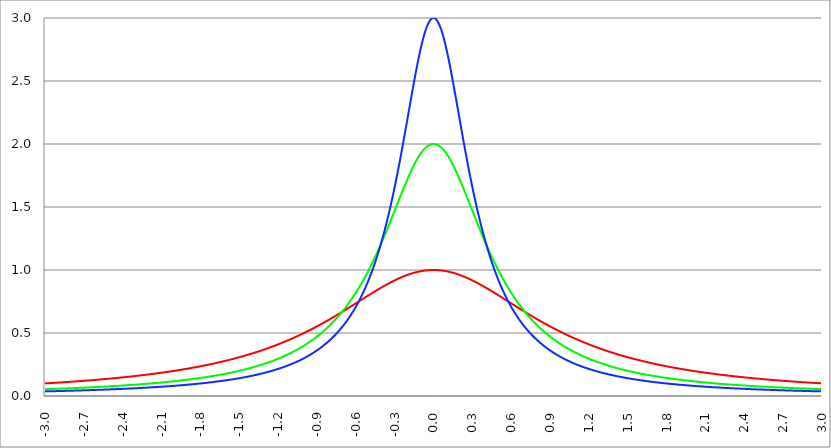
| Category | Series 1 | Series 0 | Series 2 |
|---|---|---|---|
| -3.0 | 0.1 | 0.054 | 0.037 |
| -2.997 | 0.1 | 0.054 | 0.037 |
| -2.994 | 0.1 | 0.054 | 0.037 |
| -2.991 | 0.101 | 0.054 | 0.037 |
| -2.988 | 0.101 | 0.054 | 0.037 |
| -2.984999999999999 | 0.101 | 0.055 | 0.037 |
| -2.981999999999999 | 0.101 | 0.055 | 0.037 |
| -2.978999999999999 | 0.101 | 0.055 | 0.037 |
| -2.975999999999999 | 0.101 | 0.055 | 0.037 |
| -2.972999999999999 | 0.102 | 0.055 | 0.037 |
| -2.969999999999999 | 0.102 | 0.055 | 0.037 |
| -2.966999999999999 | 0.102 | 0.055 | 0.037 |
| -2.963999999999999 | 0.102 | 0.055 | 0.037 |
| -2.960999999999998 | 0.102 | 0.055 | 0.038 |
| -2.957999999999998 | 0.103 | 0.056 | 0.038 |
| -2.954999999999998 | 0.103 | 0.056 | 0.038 |
| -2.951999999999998 | 0.103 | 0.056 | 0.038 |
| -2.948999999999998 | 0.103 | 0.056 | 0.038 |
| -2.945999999999998 | 0.103 | 0.056 | 0.038 |
| -2.942999999999998 | 0.104 | 0.056 | 0.038 |
| -2.939999999999998 | 0.104 | 0.056 | 0.038 |
| -2.936999999999998 | 0.104 | 0.056 | 0.038 |
| -2.933999999999997 | 0.104 | 0.056 | 0.038 |
| -2.930999999999997 | 0.104 | 0.057 | 0.038 |
| -2.927999999999997 | 0.104 | 0.057 | 0.038 |
| -2.924999999999997 | 0.105 | 0.057 | 0.038 |
| -2.921999999999997 | 0.105 | 0.057 | 0.039 |
| -2.918999999999997 | 0.105 | 0.057 | 0.039 |
| -2.915999999999997 | 0.105 | 0.057 | 0.039 |
| -2.912999999999997 | 0.105 | 0.057 | 0.039 |
| -2.909999999999997 | 0.106 | 0.057 | 0.039 |
| -2.906999999999996 | 0.106 | 0.057 | 0.039 |
| -2.903999999999996 | 0.106 | 0.058 | 0.039 |
| -2.900999999999996 | 0.106 | 0.058 | 0.039 |
| -2.897999999999996 | 0.106 | 0.058 | 0.039 |
| -2.894999999999996 | 0.107 | 0.058 | 0.039 |
| -2.891999999999996 | 0.107 | 0.058 | 0.039 |
| -2.888999999999996 | 0.107 | 0.058 | 0.039 |
| -2.885999999999996 | 0.107 | 0.058 | 0.039 |
| -2.882999999999996 | 0.107 | 0.058 | 0.04 |
| -2.879999999999995 | 0.108 | 0.059 | 0.04 |
| -2.876999999999995 | 0.108 | 0.059 | 0.04 |
| -2.873999999999995 | 0.108 | 0.059 | 0.04 |
| -2.870999999999995 | 0.108 | 0.059 | 0.04 |
| -2.867999999999995 | 0.108 | 0.059 | 0.04 |
| -2.864999999999995 | 0.109 | 0.059 | 0.04 |
| -2.861999999999995 | 0.109 | 0.059 | 0.04 |
| -2.858999999999995 | 0.109 | 0.059 | 0.04 |
| -2.855999999999994 | 0.109 | 0.059 | 0.04 |
| -2.852999999999994 | 0.109 | 0.06 | 0.04 |
| -2.849999999999994 | 0.11 | 0.06 | 0.04 |
| -2.846999999999994 | 0.11 | 0.06 | 0.041 |
| -2.843999999999994 | 0.11 | 0.06 | 0.041 |
| -2.840999999999994 | 0.11 | 0.06 | 0.041 |
| -2.837999999999994 | 0.11 | 0.06 | 0.041 |
| -2.834999999999994 | 0.111 | 0.06 | 0.041 |
| -2.831999999999994 | 0.111 | 0.06 | 0.041 |
| -2.828999999999993 | 0.111 | 0.061 | 0.041 |
| -2.825999999999993 | 0.111 | 0.061 | 0.041 |
| -2.822999999999993 | 0.111 | 0.061 | 0.041 |
| -2.819999999999993 | 0.112 | 0.061 | 0.041 |
| -2.816999999999993 | 0.112 | 0.061 | 0.041 |
| -2.813999999999993 | 0.112 | 0.061 | 0.042 |
| -2.810999999999993 | 0.112 | 0.061 | 0.042 |
| -2.807999999999993 | 0.113 | 0.061 | 0.042 |
| -2.804999999999993 | 0.113 | 0.062 | 0.042 |
| -2.801999999999992 | 0.113 | 0.062 | 0.042 |
| -2.798999999999992 | 0.113 | 0.062 | 0.042 |
| -2.795999999999992 | 0.113 | 0.062 | 0.042 |
| -2.792999999999992 | 0.114 | 0.062 | 0.042 |
| -2.789999999999992 | 0.114 | 0.062 | 0.042 |
| -2.786999999999992 | 0.114 | 0.062 | 0.042 |
| -2.783999999999992 | 0.114 | 0.062 | 0.042 |
| -2.780999999999992 | 0.114 | 0.063 | 0.042 |
| -2.777999999999992 | 0.115 | 0.063 | 0.043 |
| -2.774999999999991 | 0.115 | 0.063 | 0.043 |
| -2.771999999999991 | 0.115 | 0.063 | 0.043 |
| -2.768999999999991 | 0.115 | 0.063 | 0.043 |
| -2.765999999999991 | 0.116 | 0.063 | 0.043 |
| -2.762999999999991 | 0.116 | 0.063 | 0.043 |
| -2.759999999999991 | 0.116 | 0.064 | 0.043 |
| -2.756999999999991 | 0.116 | 0.064 | 0.043 |
| -2.753999999999991 | 0.116 | 0.064 | 0.043 |
| -2.75099999999999 | 0.117 | 0.064 | 0.043 |
| -2.74799999999999 | 0.117 | 0.064 | 0.044 |
| -2.74499999999999 | 0.117 | 0.064 | 0.044 |
| -2.74199999999999 | 0.117 | 0.064 | 0.044 |
| -2.73899999999999 | 0.118 | 0.064 | 0.044 |
| -2.73599999999999 | 0.118 | 0.065 | 0.044 |
| -2.73299999999999 | 0.118 | 0.065 | 0.044 |
| -2.72999999999999 | 0.118 | 0.065 | 0.044 |
| -2.72699999999999 | 0.119 | 0.065 | 0.044 |
| -2.723999999999989 | 0.119 | 0.065 | 0.044 |
| -2.720999999999989 | 0.119 | 0.065 | 0.044 |
| -2.717999999999989 | 0.119 | 0.065 | 0.044 |
| -2.714999999999989 | 0.119 | 0.066 | 0.045 |
| -2.711999999999989 | 0.12 | 0.066 | 0.045 |
| -2.708999999999989 | 0.12 | 0.066 | 0.045 |
| -2.705999999999989 | 0.12 | 0.066 | 0.045 |
| -2.702999999999989 | 0.12 | 0.066 | 0.045 |
| -2.699999999999989 | 0.121 | 0.066 | 0.045 |
| -2.696999999999988 | 0.121 | 0.066 | 0.045 |
| -2.693999999999988 | 0.121 | 0.067 | 0.045 |
| -2.690999999999988 | 0.121 | 0.067 | 0.045 |
| -2.687999999999988 | 0.122 | 0.067 | 0.045 |
| -2.684999999999988 | 0.122 | 0.067 | 0.046 |
| -2.681999999999988 | 0.122 | 0.067 | 0.046 |
| -2.678999999999988 | 0.122 | 0.067 | 0.046 |
| -2.675999999999988 | 0.123 | 0.067 | 0.046 |
| -2.672999999999988 | 0.123 | 0.068 | 0.046 |
| -2.669999999999987 | 0.123 | 0.068 | 0.046 |
| -2.666999999999987 | 0.123 | 0.068 | 0.046 |
| -2.663999999999987 | 0.124 | 0.068 | 0.046 |
| -2.660999999999987 | 0.124 | 0.068 | 0.046 |
| -2.657999999999987 | 0.124 | 0.068 | 0.046 |
| -2.654999999999987 | 0.124 | 0.069 | 0.047 |
| -2.651999999999987 | 0.124 | 0.069 | 0.047 |
| -2.648999999999987 | 0.125 | 0.069 | 0.047 |
| -2.645999999999986 | 0.125 | 0.069 | 0.047 |
| -2.642999999999986 | 0.125 | 0.069 | 0.047 |
| -2.639999999999986 | 0.125 | 0.069 | 0.047 |
| -2.636999999999986 | 0.126 | 0.069 | 0.047 |
| -2.633999999999986 | 0.126 | 0.07 | 0.047 |
| -2.630999999999986 | 0.126 | 0.07 | 0.047 |
| -2.627999999999986 | 0.126 | 0.07 | 0.048 |
| -2.624999999999986 | 0.127 | 0.07 | 0.048 |
| -2.621999999999986 | 0.127 | 0.07 | 0.048 |
| -2.618999999999985 | 0.127 | 0.07 | 0.048 |
| -2.615999999999985 | 0.127 | 0.07 | 0.048 |
| -2.612999999999985 | 0.128 | 0.071 | 0.048 |
| -2.609999999999985 | 0.128 | 0.071 | 0.048 |
| -2.606999999999985 | 0.128 | 0.071 | 0.048 |
| -2.603999999999985 | 0.129 | 0.071 | 0.048 |
| -2.600999999999985 | 0.129 | 0.071 | 0.048 |
| -2.597999999999985 | 0.129 | 0.071 | 0.049 |
| -2.594999999999985 | 0.129 | 0.072 | 0.049 |
| -2.591999999999985 | 0.13 | 0.072 | 0.049 |
| -2.588999999999984 | 0.13 | 0.072 | 0.049 |
| -2.585999999999984 | 0.13 | 0.072 | 0.049 |
| -2.582999999999984 | 0.13 | 0.072 | 0.049 |
| -2.579999999999984 | 0.131 | 0.072 | 0.049 |
| -2.576999999999984 | 0.131 | 0.073 | 0.049 |
| -2.573999999999984 | 0.131 | 0.073 | 0.049 |
| -2.570999999999984 | 0.131 | 0.073 | 0.05 |
| -2.567999999999984 | 0.132 | 0.073 | 0.05 |
| -2.564999999999984 | 0.132 | 0.073 | 0.05 |
| -2.561999999999983 | 0.132 | 0.073 | 0.05 |
| -2.558999999999983 | 0.132 | 0.074 | 0.05 |
| -2.555999999999983 | 0.133 | 0.074 | 0.05 |
| -2.552999999999983 | 0.133 | 0.074 | 0.05 |
| -2.549999999999983 | 0.133 | 0.074 | 0.05 |
| -2.546999999999983 | 0.134 | 0.074 | 0.051 |
| -2.543999999999983 | 0.134 | 0.074 | 0.051 |
| -2.540999999999983 | 0.134 | 0.075 | 0.051 |
| -2.537999999999982 | 0.134 | 0.075 | 0.051 |
| -2.534999999999982 | 0.135 | 0.075 | 0.051 |
| -2.531999999999982 | 0.135 | 0.075 | 0.051 |
| -2.528999999999982 | 0.135 | 0.075 | 0.051 |
| -2.525999999999982 | 0.135 | 0.075 | 0.051 |
| -2.522999999999982 | 0.136 | 0.076 | 0.051 |
| -2.519999999999982 | 0.136 | 0.076 | 0.052 |
| -2.516999999999982 | 0.136 | 0.076 | 0.052 |
| -2.513999999999982 | 0.137 | 0.076 | 0.052 |
| -2.510999999999981 | 0.137 | 0.076 | 0.052 |
| -2.507999999999981 | 0.137 | 0.076 | 0.052 |
| -2.504999999999981 | 0.137 | 0.077 | 0.052 |
| -2.501999999999981 | 0.138 | 0.077 | 0.052 |
| -2.498999999999981 | 0.138 | 0.077 | 0.052 |
| -2.495999999999981 | 0.138 | 0.077 | 0.053 |
| -2.492999999999981 | 0.139 | 0.077 | 0.053 |
| -2.489999999999981 | 0.139 | 0.078 | 0.053 |
| -2.486999999999981 | 0.139 | 0.078 | 0.053 |
| -2.48399999999998 | 0.139 | 0.078 | 0.053 |
| -2.48099999999998 | 0.14 | 0.078 | 0.053 |
| -2.47799999999998 | 0.14 | 0.078 | 0.053 |
| -2.47499999999998 | 0.14 | 0.078 | 0.053 |
| -2.47199999999998 | 0.141 | 0.079 | 0.054 |
| -2.46899999999998 | 0.141 | 0.079 | 0.054 |
| -2.46599999999998 | 0.141 | 0.079 | 0.054 |
| -2.46299999999998 | 0.142 | 0.079 | 0.054 |
| -2.45999999999998 | 0.142 | 0.079 | 0.054 |
| -2.456999999999979 | 0.142 | 0.08 | 0.054 |
| -2.453999999999979 | 0.142 | 0.08 | 0.054 |
| -2.450999999999979 | 0.143 | 0.08 | 0.054 |
| -2.44799999999998 | 0.143 | 0.08 | 0.055 |
| -2.444999999999979 | 0.143 | 0.08 | 0.055 |
| -2.441999999999979 | 0.144 | 0.08 | 0.055 |
| -2.438999999999979 | 0.144 | 0.081 | 0.055 |
| -2.435999999999979 | 0.144 | 0.081 | 0.055 |
| -2.432999999999978 | 0.145 | 0.081 | 0.055 |
| -2.429999999999978 | 0.145 | 0.081 | 0.055 |
| -2.426999999999978 | 0.145 | 0.081 | 0.056 |
| -2.423999999999978 | 0.145 | 0.082 | 0.056 |
| -2.420999999999978 | 0.146 | 0.082 | 0.056 |
| -2.417999999999978 | 0.146 | 0.082 | 0.056 |
| -2.414999999999978 | 0.146 | 0.082 | 0.056 |
| -2.411999999999978 | 0.147 | 0.082 | 0.056 |
| -2.408999999999978 | 0.147 | 0.083 | 0.056 |
| -2.405999999999977 | 0.147 | 0.083 | 0.056 |
| -2.402999999999977 | 0.148 | 0.083 | 0.057 |
| -2.399999999999977 | 0.148 | 0.083 | 0.057 |
| -2.396999999999977 | 0.148 | 0.083 | 0.057 |
| -2.393999999999977 | 0.149 | 0.084 | 0.057 |
| -2.390999999999977 | 0.149 | 0.084 | 0.057 |
| -2.387999999999977 | 0.149 | 0.084 | 0.057 |
| -2.384999999999977 | 0.15 | 0.084 | 0.057 |
| -2.381999999999977 | 0.15 | 0.084 | 0.058 |
| -2.378999999999976 | 0.15 | 0.085 | 0.058 |
| -2.375999999999976 | 0.15 | 0.085 | 0.058 |
| -2.372999999999976 | 0.151 | 0.085 | 0.058 |
| -2.369999999999976 | 0.151 | 0.085 | 0.058 |
| -2.366999999999976 | 0.151 | 0.085 | 0.058 |
| -2.363999999999976 | 0.152 | 0.086 | 0.058 |
| -2.360999999999976 | 0.152 | 0.086 | 0.059 |
| -2.357999999999976 | 0.152 | 0.086 | 0.059 |
| -2.354999999999976 | 0.153 | 0.086 | 0.059 |
| -2.351999999999975 | 0.153 | 0.086 | 0.059 |
| -2.348999999999975 | 0.153 | 0.087 | 0.059 |
| -2.345999999999975 | 0.154 | 0.087 | 0.059 |
| -2.342999999999975 | 0.154 | 0.087 | 0.06 |
| -2.339999999999975 | 0.154 | 0.087 | 0.06 |
| -2.336999999999975 | 0.155 | 0.088 | 0.06 |
| -2.333999999999975 | 0.155 | 0.088 | 0.06 |
| -2.330999999999975 | 0.155 | 0.088 | 0.06 |
| -2.327999999999974 | 0.156 | 0.088 | 0.06 |
| -2.324999999999974 | 0.156 | 0.088 | 0.06 |
| -2.321999999999974 | 0.156 | 0.089 | 0.061 |
| -2.318999999999974 | 0.157 | 0.089 | 0.061 |
| -2.315999999999974 | 0.157 | 0.089 | 0.061 |
| -2.312999999999974 | 0.157 | 0.089 | 0.061 |
| -2.309999999999974 | 0.158 | 0.09 | 0.061 |
| -2.306999999999974 | 0.158 | 0.09 | 0.061 |
| -2.303999999999974 | 0.159 | 0.09 | 0.062 |
| -2.300999999999973 | 0.159 | 0.09 | 0.062 |
| -2.297999999999973 | 0.159 | 0.09 | 0.062 |
| -2.294999999999973 | 0.16 | 0.091 | 0.062 |
| -2.291999999999973 | 0.16 | 0.091 | 0.062 |
| -2.288999999999973 | 0.16 | 0.091 | 0.062 |
| -2.285999999999973 | 0.161 | 0.091 | 0.062 |
| -2.282999999999973 | 0.161 | 0.092 | 0.063 |
| -2.279999999999973 | 0.161 | 0.092 | 0.063 |
| -2.276999999999973 | 0.162 | 0.092 | 0.063 |
| -2.273999999999972 | 0.162 | 0.092 | 0.063 |
| -2.270999999999972 | 0.162 | 0.092 | 0.063 |
| -2.267999999999972 | 0.163 | 0.093 | 0.063 |
| -2.264999999999972 | 0.163 | 0.093 | 0.064 |
| -2.261999999999972 | 0.163 | 0.093 | 0.064 |
| -2.258999999999972 | 0.164 | 0.093 | 0.064 |
| -2.255999999999972 | 0.164 | 0.094 | 0.064 |
| -2.252999999999972 | 0.165 | 0.094 | 0.064 |
| -2.249999999999972 | 0.165 | 0.094 | 0.064 |
| -2.246999999999971 | 0.165 | 0.094 | 0.065 |
| -2.243999999999971 | 0.166 | 0.095 | 0.065 |
| -2.240999999999971 | 0.166 | 0.095 | 0.065 |
| -2.237999999999971 | 0.166 | 0.095 | 0.065 |
| -2.234999999999971 | 0.167 | 0.095 | 0.065 |
| -2.231999999999971 | 0.167 | 0.096 | 0.065 |
| -2.228999999999971 | 0.168 | 0.096 | 0.066 |
| -2.225999999999971 | 0.168 | 0.096 | 0.066 |
| -2.222999999999971 | 0.168 | 0.096 | 0.066 |
| -2.21999999999997 | 0.169 | 0.097 | 0.066 |
| -2.21699999999997 | 0.169 | 0.097 | 0.066 |
| -2.21399999999997 | 0.169 | 0.097 | 0.066 |
| -2.21099999999997 | 0.17 | 0.097 | 0.067 |
| -2.20799999999997 | 0.17 | 0.098 | 0.067 |
| -2.20499999999997 | 0.171 | 0.098 | 0.067 |
| -2.20199999999997 | 0.171 | 0.098 | 0.067 |
| -2.19899999999997 | 0.171 | 0.098 | 0.067 |
| -2.19599999999997 | 0.172 | 0.099 | 0.068 |
| -2.192999999999969 | 0.172 | 0.099 | 0.068 |
| -2.189999999999969 | 0.173 | 0.099 | 0.068 |
| -2.186999999999969 | 0.173 | 0.099 | 0.068 |
| -2.18399999999997 | 0.173 | 0.1 | 0.068 |
| -2.180999999999969 | 0.174 | 0.1 | 0.068 |
| -2.177999999999969 | 0.174 | 0.1 | 0.069 |
| -2.174999999999969 | 0.175 | 0.1 | 0.069 |
| -2.171999999999969 | 0.175 | 0.101 | 0.069 |
| -2.168999999999968 | 0.175 | 0.101 | 0.069 |
| -2.165999999999968 | 0.176 | 0.101 | 0.069 |
| -2.162999999999968 | 0.176 | 0.101 | 0.07 |
| -2.159999999999968 | 0.177 | 0.102 | 0.07 |
| -2.156999999999968 | 0.177 | 0.102 | 0.07 |
| -2.153999999999968 | 0.177 | 0.102 | 0.07 |
| -2.150999999999968 | 0.178 | 0.103 | 0.07 |
| -2.147999999999968 | 0.178 | 0.103 | 0.071 |
| -2.144999999999968 | 0.179 | 0.103 | 0.071 |
| -2.141999999999967 | 0.179 | 0.103 | 0.071 |
| -2.138999999999967 | 0.179 | 0.104 | 0.071 |
| -2.135999999999967 | 0.18 | 0.104 | 0.071 |
| -2.132999999999967 | 0.18 | 0.104 | 0.072 |
| -2.129999999999967 | 0.181 | 0.104 | 0.072 |
| -2.126999999999967 | 0.181 | 0.105 | 0.072 |
| -2.123999999999967 | 0.181 | 0.105 | 0.072 |
| -2.120999999999967 | 0.182 | 0.105 | 0.072 |
| -2.117999999999967 | 0.182 | 0.106 | 0.073 |
| -2.114999999999966 | 0.183 | 0.106 | 0.073 |
| -2.111999999999966 | 0.183 | 0.106 | 0.073 |
| -2.108999999999966 | 0.184 | 0.106 | 0.073 |
| -2.105999999999966 | 0.184 | 0.107 | 0.073 |
| -2.102999999999966 | 0.184 | 0.107 | 0.074 |
| -2.099999999999966 | 0.185 | 0.107 | 0.074 |
| -2.096999999999966 | 0.185 | 0.108 | 0.074 |
| -2.093999999999966 | 0.186 | 0.108 | 0.074 |
| -2.090999999999966 | 0.186 | 0.108 | 0.074 |
| -2.087999999999965 | 0.187 | 0.108 | 0.075 |
| -2.084999999999965 | 0.187 | 0.109 | 0.075 |
| -2.081999999999965 | 0.187 | 0.109 | 0.075 |
| -2.078999999999965 | 0.188 | 0.109 | 0.075 |
| -2.075999999999965 | 0.188 | 0.11 | 0.075 |
| -2.072999999999965 | 0.189 | 0.11 | 0.076 |
| -2.069999999999965 | 0.189 | 0.11 | 0.076 |
| -2.066999999999965 | 0.19 | 0.111 | 0.076 |
| -2.063999999999965 | 0.19 | 0.111 | 0.076 |
| -2.060999999999964 | 0.191 | 0.111 | 0.076 |
| -2.057999999999964 | 0.191 | 0.111 | 0.077 |
| -2.054999999999964 | 0.191 | 0.112 | 0.077 |
| -2.051999999999964 | 0.192 | 0.112 | 0.077 |
| -2.048999999999964 | 0.192 | 0.112 | 0.077 |
| -2.045999999999964 | 0.193 | 0.113 | 0.078 |
| -2.042999999999964 | 0.193 | 0.113 | 0.078 |
| -2.039999999999964 | 0.194 | 0.113 | 0.078 |
| -2.036999999999963 | 0.194 | 0.114 | 0.078 |
| -2.033999999999963 | 0.195 | 0.114 | 0.078 |
| -2.030999999999963 | 0.195 | 0.114 | 0.079 |
| -2.027999999999963 | 0.196 | 0.115 | 0.079 |
| -2.024999999999963 | 0.196 | 0.115 | 0.079 |
| -2.021999999999963 | 0.197 | 0.115 | 0.079 |
| -2.018999999999963 | 0.197 | 0.116 | 0.08 |
| -2.015999999999963 | 0.197 | 0.116 | 0.08 |
| -2.012999999999963 | 0.198 | 0.116 | 0.08 |
| -2.009999999999962 | 0.198 | 0.117 | 0.08 |
| -2.006999999999962 | 0.199 | 0.117 | 0.081 |
| -2.003999999999962 | 0.199 | 0.117 | 0.081 |
| -2.000999999999962 | 0.2 | 0.118 | 0.081 |
| -1.997999999999962 | 0.2 | 0.118 | 0.081 |
| -1.994999999999962 | 0.201 | 0.118 | 0.081 |
| -1.991999999999962 | 0.201 | 0.119 | 0.082 |
| -1.988999999999963 | 0.202 | 0.119 | 0.082 |
| -1.985999999999963 | 0.202 | 0.119 | 0.082 |
| -1.982999999999963 | 0.203 | 0.12 | 0.082 |
| -1.979999999999963 | 0.203 | 0.12 | 0.083 |
| -1.976999999999963 | 0.204 | 0.12 | 0.083 |
| -1.973999999999963 | 0.204 | 0.121 | 0.083 |
| -1.970999999999963 | 0.205 | 0.121 | 0.083 |
| -1.967999999999963 | 0.205 | 0.121 | 0.084 |
| -1.964999999999963 | 0.206 | 0.122 | 0.084 |
| -1.961999999999964 | 0.206 | 0.122 | 0.084 |
| -1.958999999999964 | 0.207 | 0.122 | 0.084 |
| -1.955999999999964 | 0.207 | 0.123 | 0.085 |
| -1.952999999999964 | 0.208 | 0.123 | 0.085 |
| -1.949999999999964 | 0.208 | 0.123 | 0.085 |
| -1.946999999999964 | 0.209 | 0.124 | 0.085 |
| -1.943999999999964 | 0.209 | 0.124 | 0.086 |
| -1.940999999999964 | 0.21 | 0.124 | 0.086 |
| -1.937999999999964 | 0.21 | 0.125 | 0.086 |
| -1.934999999999964 | 0.211 | 0.125 | 0.086 |
| -1.931999999999965 | 0.211 | 0.126 | 0.087 |
| -1.928999999999965 | 0.212 | 0.126 | 0.087 |
| -1.925999999999965 | 0.212 | 0.126 | 0.087 |
| -1.922999999999965 | 0.213 | 0.127 | 0.088 |
| -1.919999999999965 | 0.213 | 0.127 | 0.088 |
| -1.916999999999965 | 0.214 | 0.127 | 0.088 |
| -1.913999999999965 | 0.214 | 0.128 | 0.088 |
| -1.910999999999965 | 0.215 | 0.128 | 0.089 |
| -1.907999999999965 | 0.215 | 0.129 | 0.089 |
| -1.904999999999966 | 0.216 | 0.129 | 0.089 |
| -1.901999999999966 | 0.217 | 0.129 | 0.089 |
| -1.898999999999966 | 0.217 | 0.13 | 0.09 |
| -1.895999999999966 | 0.218 | 0.13 | 0.09 |
| -1.892999999999966 | 0.218 | 0.13 | 0.09 |
| -1.889999999999966 | 0.219 | 0.131 | 0.091 |
| -1.886999999999966 | 0.219 | 0.131 | 0.091 |
| -1.883999999999966 | 0.22 | 0.132 | 0.091 |
| -1.880999999999966 | 0.22 | 0.132 | 0.091 |
| -1.877999999999967 | 0.221 | 0.132 | 0.092 |
| -1.874999999999967 | 0.221 | 0.133 | 0.092 |
| -1.871999999999967 | 0.222 | 0.133 | 0.092 |
| -1.868999999999967 | 0.223 | 0.134 | 0.092 |
| -1.865999999999967 | 0.223 | 0.134 | 0.093 |
| -1.862999999999967 | 0.224 | 0.134 | 0.093 |
| -1.859999999999967 | 0.224 | 0.135 | 0.093 |
| -1.856999999999967 | 0.225 | 0.135 | 0.094 |
| -1.853999999999967 | 0.225 | 0.136 | 0.094 |
| -1.850999999999968 | 0.226 | 0.136 | 0.094 |
| -1.847999999999968 | 0.226 | 0.136 | 0.095 |
| -1.844999999999968 | 0.227 | 0.137 | 0.095 |
| -1.841999999999968 | 0.228 | 0.137 | 0.095 |
| -1.838999999999968 | 0.228 | 0.138 | 0.095 |
| -1.835999999999968 | 0.229 | 0.138 | 0.096 |
| -1.832999999999968 | 0.229 | 0.139 | 0.096 |
| -1.829999999999968 | 0.23 | 0.139 | 0.096 |
| -1.826999999999968 | 0.231 | 0.139 | 0.097 |
| -1.823999999999968 | 0.231 | 0.14 | 0.097 |
| -1.820999999999969 | 0.232 | 0.14 | 0.097 |
| -1.817999999999969 | 0.232 | 0.141 | 0.098 |
| -1.814999999999969 | 0.233 | 0.141 | 0.098 |
| -1.811999999999969 | 0.233 | 0.142 | 0.098 |
| -1.808999999999969 | 0.234 | 0.142 | 0.099 |
| -1.805999999999969 | 0.235 | 0.142 | 0.099 |
| -1.802999999999969 | 0.235 | 0.143 | 0.099 |
| -1.799999999999969 | 0.236 | 0.143 | 0.099 |
| -1.796999999999969 | 0.236 | 0.144 | 0.1 |
| -1.79399999999997 | 0.237 | 0.144 | 0.1 |
| -1.79099999999997 | 0.238 | 0.145 | 0.1 |
| -1.78799999999997 | 0.238 | 0.145 | 0.101 |
| -1.78499999999997 | 0.239 | 0.146 | 0.101 |
| -1.78199999999997 | 0.239 | 0.146 | 0.101 |
| -1.77899999999997 | 0.24 | 0.146 | 0.102 |
| -1.77599999999997 | 0.241 | 0.147 | 0.102 |
| -1.77299999999997 | 0.241 | 0.147 | 0.102 |
| -1.76999999999997 | 0.242 | 0.148 | 0.103 |
| -1.766999999999971 | 0.243 | 0.148 | 0.103 |
| -1.763999999999971 | 0.243 | 0.149 | 0.103 |
| -1.760999999999971 | 0.244 | 0.149 | 0.104 |
| -1.757999999999971 | 0.244 | 0.15 | 0.104 |
| -1.754999999999971 | 0.245 | 0.15 | 0.104 |
| -1.751999999999971 | 0.246 | 0.151 | 0.105 |
| -1.748999999999971 | 0.246 | 0.151 | 0.105 |
| -1.745999999999971 | 0.247 | 0.152 | 0.105 |
| -1.742999999999971 | 0.248 | 0.152 | 0.106 |
| -1.739999999999971 | 0.248 | 0.153 | 0.106 |
| -1.736999999999972 | 0.249 | 0.153 | 0.107 |
| -1.733999999999972 | 0.25 | 0.154 | 0.107 |
| -1.730999999999972 | 0.25 | 0.154 | 0.107 |
| -1.727999999999972 | 0.251 | 0.155 | 0.108 |
| -1.724999999999972 | 0.252 | 0.155 | 0.108 |
| -1.721999999999972 | 0.252 | 0.156 | 0.108 |
| -1.718999999999972 | 0.253 | 0.156 | 0.109 |
| -1.715999999999972 | 0.254 | 0.157 | 0.109 |
| -1.712999999999972 | 0.254 | 0.157 | 0.109 |
| -1.709999999999973 | 0.255 | 0.158 | 0.11 |
| -1.706999999999973 | 0.256 | 0.158 | 0.11 |
| -1.703999999999973 | 0.256 | 0.159 | 0.111 |
| -1.700999999999973 | 0.257 | 0.159 | 0.111 |
| -1.697999999999973 | 0.258 | 0.16 | 0.111 |
| -1.694999999999973 | 0.258 | 0.16 | 0.112 |
| -1.691999999999973 | 0.259 | 0.161 | 0.112 |
| -1.688999999999973 | 0.26 | 0.161 | 0.112 |
| -1.685999999999973 | 0.26 | 0.162 | 0.113 |
| -1.682999999999974 | 0.261 | 0.162 | 0.113 |
| -1.679999999999974 | 0.262 | 0.163 | 0.114 |
| -1.676999999999974 | 0.262 | 0.163 | 0.114 |
| -1.673999999999974 | 0.263 | 0.164 | 0.114 |
| -1.670999999999974 | 0.264 | 0.164 | 0.115 |
| -1.667999999999974 | 0.264 | 0.165 | 0.115 |
| -1.664999999999974 | 0.265 | 0.165 | 0.116 |
| -1.661999999999974 | 0.266 | 0.166 | 0.116 |
| -1.658999999999974 | 0.267 | 0.167 | 0.116 |
| -1.655999999999975 | 0.267 | 0.167 | 0.117 |
| -1.652999999999975 | 0.268 | 0.168 | 0.117 |
| -1.649999999999975 | 0.269 | 0.168 | 0.118 |
| -1.646999999999975 | 0.269 | 0.169 | 0.118 |
| -1.643999999999975 | 0.27 | 0.169 | 0.118 |
| -1.640999999999975 | 0.271 | 0.17 | 0.119 |
| -1.637999999999975 | 0.272 | 0.17 | 0.119 |
| -1.634999999999975 | 0.272 | 0.171 | 0.12 |
| -1.631999999999975 | 0.273 | 0.172 | 0.12 |
| -1.628999999999975 | 0.274 | 0.172 | 0.121 |
| -1.625999999999976 | 0.274 | 0.173 | 0.121 |
| -1.622999999999976 | 0.275 | 0.173 | 0.121 |
| -1.619999999999976 | 0.276 | 0.174 | 0.122 |
| -1.616999999999976 | 0.277 | 0.175 | 0.122 |
| -1.613999999999976 | 0.277 | 0.175 | 0.123 |
| -1.610999999999976 | 0.278 | 0.176 | 0.123 |
| -1.607999999999976 | 0.279 | 0.176 | 0.124 |
| -1.604999999999976 | 0.28 | 0.177 | 0.124 |
| -1.601999999999976 | 0.28 | 0.178 | 0.124 |
| -1.598999999999977 | 0.281 | 0.178 | 0.125 |
| -1.595999999999977 | 0.282 | 0.179 | 0.125 |
| -1.592999999999977 | 0.283 | 0.179 | 0.126 |
| -1.589999999999977 | 0.283 | 0.18 | 0.126 |
| -1.586999999999977 | 0.284 | 0.181 | 0.127 |
| -1.583999999999977 | 0.285 | 0.181 | 0.127 |
| -1.580999999999977 | 0.286 | 0.182 | 0.128 |
| -1.577999999999977 | 0.287 | 0.182 | 0.128 |
| -1.574999999999978 | 0.287 | 0.183 | 0.129 |
| -1.571999999999978 | 0.288 | 0.184 | 0.129 |
| -1.568999999999978 | 0.289 | 0.184 | 0.13 |
| -1.565999999999978 | 0.29 | 0.185 | 0.13 |
| -1.562999999999978 | 0.29 | 0.186 | 0.131 |
| -1.559999999999978 | 0.291 | 0.186 | 0.131 |
| -1.556999999999978 | 0.292 | 0.187 | 0.131 |
| -1.553999999999978 | 0.293 | 0.188 | 0.132 |
| -1.550999999999978 | 0.294 | 0.188 | 0.132 |
| -1.547999999999978 | 0.294 | 0.189 | 0.133 |
| -1.544999999999979 | 0.295 | 0.19 | 0.133 |
| -1.541999999999979 | 0.296 | 0.19 | 0.134 |
| -1.538999999999979 | 0.297 | 0.191 | 0.134 |
| -1.535999999999979 | 0.298 | 0.192 | 0.135 |
| -1.532999999999979 | 0.298 | 0.192 | 0.135 |
| -1.529999999999979 | 0.299 | 0.193 | 0.136 |
| -1.526999999999979 | 0.3 | 0.194 | 0.136 |
| -1.523999999999979 | 0.301 | 0.194 | 0.137 |
| -1.520999999999979 | 0.302 | 0.195 | 0.137 |
| -1.51799999999998 | 0.303 | 0.196 | 0.138 |
| -1.51499999999998 | 0.303 | 0.196 | 0.139 |
| -1.51199999999998 | 0.304 | 0.197 | 0.139 |
| -1.50899999999998 | 0.305 | 0.198 | 0.14 |
| -1.50599999999998 | 0.306 | 0.199 | 0.14 |
| -1.50299999999998 | 0.307 | 0.199 | 0.141 |
| -1.49999999999998 | 0.308 | 0.2 | 0.141 |
| -1.49699999999998 | 0.309 | 0.201 | 0.142 |
| -1.49399999999998 | 0.309 | 0.201 | 0.142 |
| -1.490999999999981 | 0.31 | 0.202 | 0.143 |
| -1.487999999999981 | 0.311 | 0.203 | 0.143 |
| -1.484999999999981 | 0.312 | 0.204 | 0.144 |
| -1.481999999999981 | 0.313 | 0.204 | 0.144 |
| -1.478999999999981 | 0.314 | 0.205 | 0.145 |
| -1.475999999999981 | 0.315 | 0.206 | 0.146 |
| -1.472999999999981 | 0.315 | 0.207 | 0.146 |
| -1.469999999999981 | 0.316 | 0.207 | 0.147 |
| -1.466999999999981 | 0.317 | 0.208 | 0.147 |
| -1.463999999999982 | 0.318 | 0.209 | 0.148 |
| -1.460999999999982 | 0.319 | 0.21 | 0.148 |
| -1.457999999999982 | 0.32 | 0.21 | 0.149 |
| -1.454999999999982 | 0.321 | 0.211 | 0.15 |
| -1.451999999999982 | 0.322 | 0.212 | 0.15 |
| -1.448999999999982 | 0.323 | 0.213 | 0.151 |
| -1.445999999999982 | 0.324 | 0.214 | 0.151 |
| -1.442999999999982 | 0.324 | 0.214 | 0.152 |
| -1.439999999999982 | 0.325 | 0.215 | 0.153 |
| -1.436999999999982 | 0.326 | 0.216 | 0.153 |
| -1.433999999999983 | 0.327 | 0.217 | 0.154 |
| -1.430999999999983 | 0.328 | 0.218 | 0.154 |
| -1.427999999999983 | 0.329 | 0.218 | 0.155 |
| -1.424999999999983 | 0.33 | 0.219 | 0.156 |
| -1.421999999999983 | 0.331 | 0.22 | 0.156 |
| -1.418999999999983 | 0.332 | 0.221 | 0.157 |
| -1.415999999999983 | 0.333 | 0.222 | 0.158 |
| -1.412999999999983 | 0.334 | 0.223 | 0.158 |
| -1.409999999999983 | 0.335 | 0.223 | 0.159 |
| -1.406999999999984 | 0.336 | 0.224 | 0.159 |
| -1.403999999999984 | 0.337 | 0.225 | 0.16 |
| -1.400999999999984 | 0.338 | 0.226 | 0.161 |
| -1.397999999999984 | 0.338 | 0.227 | 0.161 |
| -1.394999999999984 | 0.339 | 0.228 | 0.162 |
| -1.391999999999984 | 0.34 | 0.229 | 0.163 |
| -1.388999999999984 | 0.341 | 0.229 | 0.163 |
| -1.385999999999984 | 0.342 | 0.23 | 0.164 |
| -1.382999999999984 | 0.343 | 0.231 | 0.165 |
| -1.379999999999985 | 0.344 | 0.232 | 0.165 |
| -1.376999999999985 | 0.345 | 0.233 | 0.166 |
| -1.373999999999985 | 0.346 | 0.234 | 0.167 |
| -1.370999999999985 | 0.347 | 0.235 | 0.167 |
| -1.367999999999985 | 0.348 | 0.236 | 0.168 |
| -1.364999999999985 | 0.349 | 0.237 | 0.169 |
| -1.361999999999985 | 0.35 | 0.238 | 0.17 |
| -1.358999999999985 | 0.351 | 0.238 | 0.17 |
| -1.355999999999985 | 0.352 | 0.239 | 0.171 |
| -1.352999999999985 | 0.353 | 0.24 | 0.172 |
| -1.349999999999986 | 0.354 | 0.241 | 0.172 |
| -1.346999999999986 | 0.355 | 0.242 | 0.173 |
| -1.343999999999986 | 0.356 | 0.243 | 0.174 |
| -1.340999999999986 | 0.357 | 0.244 | 0.175 |
| -1.337999999999986 | 0.358 | 0.245 | 0.175 |
| -1.334999999999986 | 0.359 | 0.246 | 0.176 |
| -1.331999999999986 | 0.36 | 0.247 | 0.177 |
| -1.328999999999986 | 0.362 | 0.248 | 0.178 |
| -1.325999999999986 | 0.363 | 0.249 | 0.178 |
| -1.322999999999987 | 0.364 | 0.25 | 0.179 |
| -1.319999999999987 | 0.365 | 0.251 | 0.18 |
| -1.316999999999987 | 0.366 | 0.252 | 0.181 |
| -1.313999999999987 | 0.367 | 0.253 | 0.181 |
| -1.310999999999987 | 0.368 | 0.254 | 0.182 |
| -1.307999999999987 | 0.369 | 0.255 | 0.183 |
| -1.304999999999987 | 0.37 | 0.256 | 0.184 |
| -1.301999999999987 | 0.371 | 0.257 | 0.185 |
| -1.298999999999987 | 0.372 | 0.258 | 0.185 |
| -1.295999999999988 | 0.373 | 0.259 | 0.186 |
| -1.292999999999988 | 0.374 | 0.26 | 0.187 |
| -1.289999999999988 | 0.375 | 0.261 | 0.188 |
| -1.286999999999988 | 0.376 | 0.262 | 0.189 |
| -1.283999999999988 | 0.378 | 0.263 | 0.189 |
| -1.280999999999988 | 0.379 | 0.264 | 0.19 |
| -1.277999999999988 | 0.38 | 0.265 | 0.191 |
| -1.274999999999988 | 0.381 | 0.267 | 0.192 |
| -1.271999999999988 | 0.382 | 0.268 | 0.193 |
| -1.268999999999989 | 0.383 | 0.269 | 0.194 |
| -1.265999999999989 | 0.384 | 0.27 | 0.194 |
| -1.262999999999989 | 0.385 | 0.271 | 0.195 |
| -1.259999999999989 | 0.386 | 0.272 | 0.196 |
| -1.256999999999989 | 0.388 | 0.273 | 0.197 |
| -1.253999999999989 | 0.389 | 0.274 | 0.198 |
| -1.250999999999989 | 0.39 | 0.275 | 0.199 |
| -1.247999999999989 | 0.391 | 0.277 | 0.2 |
| -1.244999999999989 | 0.392 | 0.278 | 0.201 |
| -1.24199999999999 | 0.393 | 0.279 | 0.202 |
| -1.23899999999999 | 0.394 | 0.28 | 0.202 |
| -1.23599999999999 | 0.396 | 0.281 | 0.203 |
| -1.23299999999999 | 0.397 | 0.282 | 0.204 |
| -1.22999999999999 | 0.398 | 0.284 | 0.205 |
| -1.22699999999999 | 0.399 | 0.285 | 0.206 |
| -1.22399999999999 | 0.4 | 0.286 | 0.207 |
| -1.22099999999999 | 0.401 | 0.287 | 0.208 |
| -1.21799999999999 | 0.403 | 0.288 | 0.209 |
| -1.214999999999991 | 0.404 | 0.29 | 0.21 |
| -1.211999999999991 | 0.405 | 0.291 | 0.211 |
| -1.208999999999991 | 0.406 | 0.292 | 0.212 |
| -1.205999999999991 | 0.407 | 0.293 | 0.213 |
| -1.202999999999991 | 0.409 | 0.295 | 0.214 |
| -1.199999999999991 | 0.41 | 0.296 | 0.215 |
| -1.196999999999991 | 0.411 | 0.297 | 0.216 |
| -1.193999999999991 | 0.412 | 0.298 | 0.217 |
| -1.190999999999991 | 0.413 | 0.3 | 0.218 |
| -1.187999999999991 | 0.415 | 0.301 | 0.219 |
| -1.184999999999992 | 0.416 | 0.302 | 0.22 |
| -1.181999999999992 | 0.417 | 0.304 | 0.221 |
| -1.178999999999992 | 0.418 | 0.305 | 0.222 |
| -1.175999999999992 | 0.42 | 0.306 | 0.223 |
| -1.172999999999992 | 0.421 | 0.308 | 0.224 |
| -1.169999999999992 | 0.422 | 0.309 | 0.225 |
| -1.166999999999992 | 0.423 | 0.31 | 0.226 |
| -1.163999999999992 | 0.425 | 0.312 | 0.227 |
| -1.160999999999992 | 0.426 | 0.313 | 0.228 |
| -1.157999999999993 | 0.427 | 0.314 | 0.23 |
| -1.154999999999993 | 0.428 | 0.316 | 0.231 |
| -1.151999999999993 | 0.43 | 0.317 | 0.232 |
| -1.148999999999993 | 0.431 | 0.318 | 0.233 |
| -1.145999999999993 | 0.432 | 0.32 | 0.234 |
| -1.142999999999993 | 0.434 | 0.321 | 0.235 |
| -1.139999999999993 | 0.435 | 0.323 | 0.236 |
| -1.136999999999993 | 0.436 | 0.324 | 0.237 |
| -1.133999999999993 | 0.437 | 0.326 | 0.239 |
| -1.130999999999994 | 0.439 | 0.327 | 0.24 |
| -1.127999999999994 | 0.44 | 0.328 | 0.241 |
| -1.124999999999994 | 0.441 | 0.33 | 0.242 |
| -1.121999999999994 | 0.443 | 0.331 | 0.243 |
| -1.118999999999994 | 0.444 | 0.333 | 0.245 |
| -1.115999999999994 | 0.445 | 0.334 | 0.246 |
| -1.112999999999994 | 0.447 | 0.336 | 0.247 |
| -1.109999999999994 | 0.448 | 0.337 | 0.248 |
| -1.106999999999994 | 0.449 | 0.339 | 0.249 |
| -1.103999999999995 | 0.451 | 0.34 | 0.251 |
| -1.100999999999995 | 0.452 | 0.342 | 0.252 |
| -1.097999999999995 | 0.453 | 0.344 | 0.253 |
| -1.094999999999995 | 0.455 | 0.345 | 0.254 |
| -1.091999999999995 | 0.456 | 0.347 | 0.256 |
| -1.088999999999995 | 0.457 | 0.348 | 0.257 |
| -1.085999999999995 | 0.459 | 0.35 | 0.258 |
| -1.082999999999995 | 0.46 | 0.351 | 0.26 |
| -1.079999999999995 | 0.462 | 0.353 | 0.261 |
| -1.076999999999996 | 0.463 | 0.355 | 0.262 |
| -1.073999999999996 | 0.464 | 0.356 | 0.264 |
| -1.070999999999996 | 0.466 | 0.358 | 0.265 |
| -1.067999999999996 | 0.467 | 0.36 | 0.266 |
| -1.064999999999996 | 0.469 | 0.361 | 0.268 |
| -1.061999999999996 | 0.47 | 0.363 | 0.269 |
| -1.058999999999996 | 0.471 | 0.365 | 0.27 |
| -1.055999999999996 | 0.473 | 0.366 | 0.272 |
| -1.052999999999996 | 0.474 | 0.368 | 0.273 |
| -1.049999999999996 | 0.476 | 0.37 | 0.275 |
| -1.046999999999997 | 0.477 | 0.371 | 0.276 |
| -1.043999999999997 | 0.478 | 0.373 | 0.278 |
| -1.040999999999997 | 0.48 | 0.375 | 0.279 |
| -1.037999999999997 | 0.481 | 0.377 | 0.28 |
| -1.034999999999997 | 0.483 | 0.378 | 0.282 |
| -1.031999999999997 | 0.484 | 0.38 | 0.283 |
| -1.028999999999997 | 0.486 | 0.382 | 0.285 |
| -1.025999999999997 | 0.487 | 0.384 | 0.286 |
| -1.022999999999997 | 0.489 | 0.386 | 0.288 |
| -1.019999999999998 | 0.49 | 0.387 | 0.289 |
| -1.016999999999998 | 0.492 | 0.389 | 0.291 |
| -1.013999999999998 | 0.493 | 0.391 | 0.293 |
| -1.010999999999998 | 0.495 | 0.393 | 0.294 |
| -1.007999999999998 | 0.496 | 0.395 | 0.296 |
| -1.004999999999998 | 0.498 | 0.397 | 0.297 |
| -1.001999999999998 | 0.499 | 0.399 | 0.299 |
| -0.998999999999998 | 0.501 | 0.401 | 0.301 |
| -0.995999999999998 | 0.502 | 0.403 | 0.302 |
| -0.992999999999998 | 0.504 | 0.405 | 0.304 |
| -0.989999999999998 | 0.505 | 0.406 | 0.305 |
| -0.986999999999998 | 0.507 | 0.408 | 0.307 |
| -0.983999999999998 | 0.508 | 0.41 | 0.309 |
| -0.980999999999998 | 0.51 | 0.412 | 0.311 |
| -0.977999999999998 | 0.511 | 0.414 | 0.312 |
| -0.974999999999998 | 0.513 | 0.416 | 0.314 |
| -0.971999999999998 | 0.514 | 0.418 | 0.316 |
| -0.968999999999998 | 0.516 | 0.421 | 0.317 |
| -0.965999999999998 | 0.517 | 0.423 | 0.319 |
| -0.962999999999998 | 0.519 | 0.425 | 0.321 |
| -0.959999999999998 | 0.52 | 0.427 | 0.323 |
| -0.956999999999998 | 0.522 | 0.429 | 0.325 |
| -0.953999999999998 | 0.524 | 0.431 | 0.326 |
| -0.950999999999998 | 0.525 | 0.433 | 0.328 |
| -0.947999999999998 | 0.527 | 0.435 | 0.33 |
| -0.944999999999998 | 0.528 | 0.437 | 0.332 |
| -0.941999999999998 | 0.53 | 0.44 | 0.334 |
| -0.938999999999998 | 0.531 | 0.442 | 0.336 |
| -0.935999999999998 | 0.533 | 0.444 | 0.338 |
| -0.932999999999998 | 0.535 | 0.446 | 0.34 |
| -0.929999999999998 | 0.536 | 0.448 | 0.342 |
| -0.926999999999998 | 0.538 | 0.451 | 0.343 |
| -0.923999999999998 | 0.539 | 0.453 | 0.345 |
| -0.920999999999998 | 0.541 | 0.455 | 0.347 |
| -0.917999999999998 | 0.543 | 0.458 | 0.349 |
| -0.914999999999998 | 0.544 | 0.46 | 0.351 |
| -0.911999999999998 | 0.546 | 0.462 | 0.354 |
| -0.908999999999998 | 0.548 | 0.465 | 0.356 |
| -0.905999999999998 | 0.549 | 0.467 | 0.358 |
| -0.902999999999998 | 0.551 | 0.469 | 0.36 |
| -0.899999999999998 | 0.552 | 0.472 | 0.362 |
| -0.896999999999998 | 0.554 | 0.474 | 0.364 |
| -0.893999999999998 | 0.556 | 0.477 | 0.366 |
| -0.890999999999998 | 0.557 | 0.479 | 0.368 |
| -0.887999999999998 | 0.559 | 0.481 | 0.371 |
| -0.884999999999998 | 0.561 | 0.484 | 0.373 |
| -0.881999999999998 | 0.562 | 0.486 | 0.375 |
| -0.878999999999998 | 0.564 | 0.489 | 0.377 |
| -0.875999999999998 | 0.566 | 0.491 | 0.379 |
| -0.872999999999998 | 0.567 | 0.494 | 0.382 |
| -0.869999999999998 | 0.569 | 0.497 | 0.384 |
| -0.866999999999998 | 0.571 | 0.499 | 0.386 |
| -0.863999999999998 | 0.573 | 0.502 | 0.389 |
| -0.860999999999998 | 0.574 | 0.504 | 0.391 |
| -0.857999999999998 | 0.576 | 0.507 | 0.393 |
| -0.854999999999998 | 0.578 | 0.51 | 0.396 |
| -0.851999999999998 | 0.579 | 0.512 | 0.398 |
| -0.848999999999998 | 0.581 | 0.515 | 0.401 |
| -0.845999999999998 | 0.583 | 0.518 | 0.403 |
| -0.842999999999998 | 0.585 | 0.52 | 0.406 |
| -0.839999999999998 | 0.586 | 0.523 | 0.408 |
| -0.836999999999998 | 0.588 | 0.526 | 0.411 |
| -0.833999999999998 | 0.59 | 0.529 | 0.413 |
| -0.830999999999998 | 0.592 | 0.532 | 0.416 |
| -0.827999999999998 | 0.593 | 0.534 | 0.418 |
| -0.824999999999998 | 0.595 | 0.537 | 0.421 |
| -0.821999999999998 | 0.597 | 0.54 | 0.424 |
| -0.818999999999998 | 0.599 | 0.543 | 0.426 |
| -0.815999999999998 | 0.6 | 0.546 | 0.429 |
| -0.812999999999998 | 0.602 | 0.549 | 0.432 |
| -0.809999999999998 | 0.604 | 0.552 | 0.434 |
| -0.806999999999998 | 0.606 | 0.555 | 0.437 |
| -0.803999999999998 | 0.607 | 0.558 | 0.44 |
| -0.800999999999998 | 0.609 | 0.561 | 0.443 |
| -0.797999999999998 | 0.611 | 0.564 | 0.446 |
| -0.794999999999998 | 0.613 | 0.567 | 0.449 |
| -0.791999999999998 | 0.615 | 0.57 | 0.451 |
| -0.788999999999998 | 0.616 | 0.573 | 0.454 |
| -0.785999999999998 | 0.618 | 0.576 | 0.457 |
| -0.782999999999998 | 0.62 | 0.579 | 0.46 |
| -0.779999999999998 | 0.622 | 0.582 | 0.463 |
| -0.776999999999998 | 0.624 | 0.586 | 0.466 |
| -0.773999999999998 | 0.625 | 0.589 | 0.469 |
| -0.770999999999998 | 0.627 | 0.592 | 0.472 |
| -0.767999999999998 | 0.629 | 0.595 | 0.476 |
| -0.764999999999998 | 0.631 | 0.599 | 0.479 |
| -0.761999999999998 | 0.633 | 0.602 | 0.482 |
| -0.758999999999998 | 0.634 | 0.605 | 0.485 |
| -0.755999999999998 | 0.636 | 0.609 | 0.488 |
| -0.752999999999998 | 0.638 | 0.612 | 0.492 |
| -0.749999999999998 | 0.64 | 0.615 | 0.495 |
| -0.746999999999998 | 0.642 | 0.619 | 0.498 |
| -0.743999999999998 | 0.644 | 0.622 | 0.502 |
| -0.740999999999998 | 0.646 | 0.626 | 0.505 |
| -0.737999999999998 | 0.647 | 0.629 | 0.508 |
| -0.734999999999998 | 0.649 | 0.633 | 0.512 |
| -0.731999999999998 | 0.651 | 0.636 | 0.515 |
| -0.728999999999998 | 0.653 | 0.64 | 0.519 |
| -0.725999999999998 | 0.655 | 0.643 | 0.522 |
| -0.722999999999998 | 0.657 | 0.647 | 0.526 |
| -0.719999999999998 | 0.659 | 0.651 | 0.53 |
| -0.716999999999998 | 0.66 | 0.654 | 0.533 |
| -0.713999999999998 | 0.662 | 0.658 | 0.537 |
| -0.710999999999998 | 0.664 | 0.662 | 0.541 |
| -0.707999999999998 | 0.666 | 0.666 | 0.544 |
| -0.704999999999998 | 0.668 | 0.669 | 0.548 |
| -0.701999999999998 | 0.67 | 0.673 | 0.552 |
| -0.698999999999998 | 0.672 | 0.677 | 0.556 |
| -0.695999999999998 | 0.674 | 0.681 | 0.56 |
| -0.692999999999998 | 0.676 | 0.685 | 0.564 |
| -0.689999999999998 | 0.677 | 0.689 | 0.568 |
| -0.686999999999998 | 0.679 | 0.693 | 0.572 |
| -0.683999999999998 | 0.681 | 0.697 | 0.576 |
| -0.680999999999998 | 0.683 | 0.701 | 0.58 |
| -0.677999999999998 | 0.685 | 0.705 | 0.584 |
| -0.674999999999998 | 0.687 | 0.709 | 0.588 |
| -0.671999999999998 | 0.689 | 0.713 | 0.592 |
| -0.668999999999998 | 0.691 | 0.717 | 0.597 |
| -0.665999999999998 | 0.693 | 0.721 | 0.601 |
| -0.662999999999998 | 0.695 | 0.725 | 0.605 |
| -0.659999999999998 | 0.697 | 0.729 | 0.61 |
| -0.656999999999998 | 0.698 | 0.734 | 0.614 |
| -0.653999999999998 | 0.7 | 0.738 | 0.619 |
| -0.650999999999998 | 0.702 | 0.742 | 0.623 |
| -0.647999999999998 | 0.704 | 0.746 | 0.628 |
| -0.644999999999998 | 0.706 | 0.751 | 0.632 |
| -0.641999999999998 | 0.708 | 0.755 | 0.637 |
| -0.638999999999998 | 0.71 | 0.76 | 0.642 |
| -0.635999999999998 | 0.712 | 0.764 | 0.646 |
| -0.632999999999998 | 0.714 | 0.768 | 0.651 |
| -0.629999999999998 | 0.716 | 0.773 | 0.656 |
| -0.626999999999998 | 0.718 | 0.777 | 0.661 |
| -0.623999999999998 | 0.72 | 0.782 | 0.666 |
| -0.620999999999998 | 0.722 | 0.787 | 0.671 |
| -0.617999999999998 | 0.724 | 0.791 | 0.676 |
| -0.614999999999998 | 0.726 | 0.796 | 0.681 |
| -0.611999999999998 | 0.728 | 0.801 | 0.686 |
| -0.608999999999998 | 0.729 | 0.805 | 0.692 |
| -0.605999999999998 | 0.731 | 0.81 | 0.697 |
| -0.602999999999998 | 0.733 | 0.815 | 0.702 |
| -0.599999999999998 | 0.735 | 0.82 | 0.708 |
| -0.596999999999998 | 0.737 | 0.825 | 0.713 |
| -0.593999999999998 | 0.739 | 0.829 | 0.718 |
| -0.590999999999998 | 0.741 | 0.834 | 0.724 |
| -0.587999999999998 | 0.743 | 0.839 | 0.73 |
| -0.584999999999998 | 0.745 | 0.844 | 0.735 |
| -0.581999999999998 | 0.747 | 0.849 | 0.741 |
| -0.578999999999998 | 0.749 | 0.854 | 0.747 |
| -0.575999999999998 | 0.751 | 0.859 | 0.753 |
| -0.572999999999998 | 0.753 | 0.865 | 0.759 |
| -0.569999999999998 | 0.755 | 0.87 | 0.765 |
| -0.566999999999998 | 0.757 | 0.875 | 0.771 |
| -0.563999999999998 | 0.759 | 0.88 | 0.777 |
| -0.560999999999998 | 0.761 | 0.885 | 0.783 |
| -0.557999999999998 | 0.763 | 0.891 | 0.789 |
| -0.554999999999998 | 0.765 | 0.896 | 0.795 |
| -0.551999999999998 | 0.766 | 0.901 | 0.802 |
| -0.548999999999998 | 0.768 | 0.907 | 0.808 |
| -0.545999999999998 | 0.77 | 0.912 | 0.815 |
| -0.542999999999998 | 0.772 | 0.918 | 0.821 |
| -0.539999999999998 | 0.774 | 0.923 | 0.828 |
| -0.536999999999998 | 0.776 | 0.929 | 0.834 |
| -0.533999999999998 | 0.778 | 0.934 | 0.841 |
| -0.530999999999998 | 0.78 | 0.94 | 0.848 |
| -0.527999999999998 | 0.782 | 0.946 | 0.855 |
| -0.524999999999998 | 0.784 | 0.951 | 0.862 |
| -0.521999999999998 | 0.786 | 0.957 | 0.869 |
| -0.518999999999998 | 0.788 | 0.963 | 0.876 |
| -0.515999999999998 | 0.79 | 0.969 | 0.883 |
| -0.512999999999998 | 0.792 | 0.974 | 0.891 |
| -0.509999999999998 | 0.794 | 0.98 | 0.898 |
| -0.506999999999998 | 0.796 | 0.986 | 0.905 |
| -0.503999999999998 | 0.797 | 0.992 | 0.913 |
| -0.500999999999998 | 0.799 | 0.998 | 0.921 |
| -0.497999999999998 | 0.801 | 1.004 | 0.928 |
| -0.494999999999998 | 0.803 | 1.01 | 0.936 |
| -0.491999999999998 | 0.805 | 1.016 | 0.944 |
| -0.488999999999998 | 0.807 | 1.022 | 0.952 |
| -0.485999999999998 | 0.809 | 1.028 | 0.96 |
| -0.482999999999998 | 0.811 | 1.035 | 0.968 |
| -0.479999999999998 | 0.813 | 1.041 | 0.976 |
| -0.476999999999998 | 0.815 | 1.047 | 0.984 |
| -0.473999999999998 | 0.817 | 1.053 | 0.993 |
| -0.470999999999998 | 0.818 | 1.06 | 1.001 |
| -0.467999999999998 | 0.82 | 1.066 | 1.01 |
| -0.464999999999998 | 0.822 | 1.072 | 1.018 |
| -0.461999999999998 | 0.824 | 1.079 | 1.027 |
| -0.458999999999998 | 0.826 | 1.085 | 1.036 |
| -0.455999999999998 | 0.828 | 1.092 | 1.045 |
| -0.452999999999998 | 0.83 | 1.098 | 1.054 |
| -0.449999999999998 | 0.832 | 1.105 | 1.063 |
| -0.446999999999998 | 0.833 | 1.112 | 1.072 |
| -0.443999999999998 | 0.835 | 1.118 | 1.081 |
| -0.440999999999998 | 0.837 | 1.125 | 1.091 |
| -0.437999999999998 | 0.839 | 1.132 | 1.1 |
| -0.434999999999998 | 0.841 | 1.138 | 1.11 |
| -0.431999999999998 | 0.843 | 1.145 | 1.12 |
| -0.428999999999998 | 0.845 | 1.152 | 1.129 |
| -0.425999999999998 | 0.846 | 1.159 | 1.139 |
| -0.422999999999998 | 0.848 | 1.166 | 1.149 |
| -0.419999999999998 | 0.85 | 1.173 | 1.159 |
| -0.416999999999998 | 0.852 | 1.18 | 1.17 |
| -0.413999999999998 | 0.854 | 1.187 | 1.18 |
| -0.410999999999998 | 0.855 | 1.194 | 1.19 |
| -0.407999999999998 | 0.857 | 1.201 | 1.201 |
| -0.404999999999998 | 0.859 | 1.208 | 1.212 |
| -0.401999999999998 | 0.861 | 1.215 | 1.222 |
| -0.398999999999998 | 0.863 | 1.222 | 1.233 |
| -0.395999999999998 | 0.864 | 1.229 | 1.244 |
| -0.392999999999998 | 0.866 | 1.236 | 1.255 |
| -0.389999999999998 | 0.868 | 1.243 | 1.266 |
| -0.386999999999998 | 0.87 | 1.251 | 1.278 |
| -0.383999999999998 | 0.871 | 1.258 | 1.289 |
| -0.380999999999998 | 0.873 | 1.265 | 1.301 |
| -0.377999999999998 | 0.875 | 1.273 | 1.312 |
| -0.374999999999998 | 0.877 | 1.28 | 1.324 |
| -0.371999999999998 | 0.878 | 1.287 | 1.336 |
| -0.368999999999998 | 0.88 | 1.295 | 1.348 |
| -0.365999999999998 | 0.882 | 1.302 | 1.36 |
| -0.362999999999998 | 0.884 | 1.31 | 1.372 |
| -0.359999999999998 | 0.885 | 1.317 | 1.385 |
| -0.356999999999998 | 0.887 | 1.325 | 1.397 |
| -0.353999999999998 | 0.889 | 1.332 | 1.41 |
| -0.350999999999998 | 0.89 | 1.34 | 1.423 |
| -0.347999999999998 | 0.892 | 1.347 | 1.435 |
| -0.344999999999998 | 0.894 | 1.355 | 1.448 |
| -0.341999999999998 | 0.895 | 1.363 | 1.462 |
| -0.338999999999998 | 0.897 | 1.37 | 1.475 |
| -0.335999999999998 | 0.899 | 1.378 | 1.488 |
| -0.332999999999998 | 0.9 | 1.385 | 1.502 |
| -0.329999999999998 | 0.902 | 1.393 | 1.515 |
| -0.326999999999998 | 0.903 | 1.401 | 1.529 |
| -0.323999999999998 | 0.905 | 1.409 | 1.543 |
| -0.320999999999998 | 0.907 | 1.416 | 1.557 |
| -0.317999999999998 | 0.908 | 1.424 | 1.571 |
| -0.314999999999998 | 0.91 | 1.432 | 1.585 |
| -0.311999999999998 | 0.911 | 1.439 | 1.599 |
| -0.308999999999998 | 0.913 | 1.447 | 1.613 |
| -0.305999999999998 | 0.914 | 1.455 | 1.628 |
| -0.302999999999998 | 0.916 | 1.463 | 1.643 |
| -0.299999999999998 | 0.917 | 1.471 | 1.657 |
| -0.296999999999998 | 0.919 | 1.478 | 1.672 |
| -0.293999999999998 | 0.92 | 1.486 | 1.687 |
| -0.290999999999998 | 0.922 | 1.494 | 1.702 |
| -0.287999999999998 | 0.923 | 1.502 | 1.718 |
| -0.284999999999998 | 0.925 | 1.51 | 1.733 |
| -0.281999999999998 | 0.926 | 1.517 | 1.749 |
| -0.278999999999998 | 0.928 | 1.525 | 1.764 |
| -0.275999999999998 | 0.929 | 1.533 | 1.78 |
| -0.272999999999998 | 0.931 | 1.541 | 1.796 |
| -0.269999999999998 | 0.932 | 1.548 | 1.811 |
| -0.266999999999998 | 0.933 | 1.556 | 1.827 |
| -0.263999999999998 | 0.935 | 1.564 | 1.844 |
| -0.260999999999998 | 0.936 | 1.572 | 1.86 |
| -0.257999999999998 | 0.938 | 1.579 | 1.876 |
| -0.254999999999998 | 0.939 | 1.587 | 1.892 |
| -0.251999999999998 | 0.94 | 1.595 | 1.909 |
| -0.248999999999998 | 0.942 | 1.603 | 1.926 |
| -0.245999999999998 | 0.943 | 1.61 | 1.942 |
| -0.242999999999998 | 0.944 | 1.618 | 1.959 |
| -0.239999999999998 | 0.946 | 1.625 | 1.976 |
| -0.236999999999998 | 0.947 | 1.633 | 1.993 |
| -0.233999999999998 | 0.948 | 1.641 | 2.01 |
| -0.230999999999998 | 0.949 | 1.648 | 2.027 |
| -0.227999999999998 | 0.951 | 1.656 | 2.044 |
| -0.224999999999998 | 0.952 | 1.663 | 2.061 |
| -0.221999999999998 | 0.953 | 1.671 | 2.078 |
| -0.218999999999998 | 0.954 | 1.678 | 2.095 |
| -0.215999999999998 | 0.955 | 1.685 | 2.113 |
| -0.212999999999998 | 0.957 | 1.693 | 2.13 |
| -0.209999999999998 | 0.958 | 1.7 | 2.148 |
| -0.206999999999998 | 0.959 | 1.707 | 2.165 |
| -0.203999999999998 | 0.96 | 1.715 | 2.183 |
| -0.200999999999998 | 0.961 | 1.722 | 2.2 |
| -0.197999999999997 | 0.962 | 1.729 | 2.218 |
| -0.194999999999997 | 0.963 | 1.736 | 2.235 |
| -0.191999999999997 | 0.964 | 1.743 | 2.253 |
| -0.188999999999997 | 0.966 | 1.75 | 2.27 |
| -0.185999999999997 | 0.967 | 1.757 | 2.288 |
| -0.182999999999997 | 0.968 | 1.764 | 2.305 |
| -0.179999999999997 | 0.969 | 1.771 | 2.323 |
| -0.176999999999997 | 0.97 | 1.777 | 2.34 |
| -0.173999999999997 | 0.971 | 1.784 | 2.358 |
| -0.170999999999997 | 0.972 | 1.791 | 2.375 |
| -0.167999999999997 | 0.973 | 1.797 | 2.392 |
| -0.164999999999997 | 0.973 | 1.804 | 2.41 |
| -0.161999999999997 | 0.974 | 1.81 | 2.427 |
| -0.158999999999997 | 0.975 | 1.816 | 2.444 |
| -0.155999999999997 | 0.976 | 1.823 | 2.461 |
| -0.152999999999997 | 0.977 | 1.829 | 2.478 |
| -0.149999999999997 | 0.978 | 1.835 | 2.495 |
| -0.146999999999997 | 0.979 | 1.841 | 2.512 |
| -0.143999999999997 | 0.98 | 1.847 | 2.528 |
| -0.140999999999997 | 0.981 | 1.853 | 2.545 |
| -0.137999999999997 | 0.981 | 1.858 | 2.561 |
| -0.134999999999997 | 0.982 | 1.864 | 2.577 |
| -0.131999999999997 | 0.983 | 1.87 | 2.593 |
| -0.128999999999997 | 0.984 | 1.875 | 2.609 |
| -0.125999999999997 | 0.984 | 1.881 | 2.625 |
| -0.122999999999997 | 0.985 | 1.886 | 2.64 |
| -0.119999999999997 | 0.986 | 1.891 | 2.656 |
| -0.116999999999997 | 0.986 | 1.896 | 2.671 |
| -0.113999999999997 | 0.987 | 1.901 | 2.686 |
| -0.110999999999997 | 0.988 | 1.906 | 2.701 |
| -0.107999999999997 | 0.988 | 1.911 | 2.715 |
| -0.104999999999997 | 0.989 | 1.916 | 2.729 |
| -0.101999999999997 | 0.99 | 1.92 | 2.743 |
| -0.0989999999999974 | 0.99 | 1.925 | 2.757 |
| -0.0959999999999974 | 0.991 | 1.929 | 2.77 |
| -0.0929999999999974 | 0.991 | 1.933 | 2.783 |
| -0.0899999999999974 | 0.992 | 1.937 | 2.796 |
| -0.0869999999999974 | 0.992 | 1.941 | 2.809 |
| -0.0839999999999974 | 0.993 | 1.945 | 2.821 |
| -0.0809999999999974 | 0.993 | 1.949 | 2.833 |
| -0.0779999999999974 | 0.994 | 1.952 | 2.844 |
| -0.0749999999999974 | 0.994 | 1.956 | 2.855 |
| -0.0719999999999974 | 0.995 | 1.959 | 2.866 |
| -0.0689999999999974 | 0.995 | 1.963 | 2.877 |
| -0.0659999999999974 | 0.996 | 1.966 | 2.887 |
| -0.0629999999999974 | 0.996 | 1.969 | 2.897 |
| -0.0599999999999974 | 0.996 | 1.972 | 2.906 |
| -0.0569999999999974 | 0.997 | 1.974 | 2.915 |
| -0.0539999999999974 | 0.997 | 1.977 | 2.923 |
| -0.0509999999999974 | 0.997 | 1.979 | 2.931 |
| -0.0479999999999974 | 0.998 | 1.982 | 2.939 |
| -0.0449999999999974 | 0.998 | 1.984 | 2.946 |
| -0.0419999999999974 | 0.998 | 1.986 | 2.953 |
| -0.0389999999999974 | 0.998 | 1.988 | 2.959 |
| -0.0359999999999974 | 0.999 | 1.99 | 2.965 |
| -0.0329999999999974 | 0.999 | 1.991 | 2.971 |
| -0.0299999999999974 | 0.999 | 1.993 | 2.976 |
| -0.0269999999999974 | 0.999 | 1.994 | 2.98 |
| -0.0239999999999974 | 0.999 | 1.995 | 2.985 |
| -0.0209999999999974 | 1 | 1.996 | 2.988 |
| -0.0179999999999974 | 1 | 1.997 | 2.991 |
| -0.0149999999999974 | 1 | 1.998 | 2.994 |
| -0.0119999999999974 | 1 | 1.999 | 2.996 |
| -0.00899999999999737 | 1 | 1.999 | 2.998 |
| -0.00599999999999737 | 1 | 2 | 2.999 |
| -0.00299999999999737 | 1 | 2 | 3 |
| 2.62897342784285e-15 | 1 | 2 | 3 |
| 0.00300000000000263 | 1 | 2 | 3 |
| 0.00600000000000263 | 1 | 2 | 2.999 |
| 0.00900000000000263 | 1 | 1.999 | 2.998 |
| 0.0120000000000026 | 1 | 1.999 | 2.996 |
| 0.0150000000000026 | 1 | 1.998 | 2.994 |
| 0.0180000000000026 | 1 | 1.997 | 2.991 |
| 0.0210000000000026 | 1 | 1.996 | 2.988 |
| 0.0240000000000026 | 0.999 | 1.995 | 2.985 |
| 0.0270000000000026 | 0.999 | 1.994 | 2.98 |
| 0.0300000000000026 | 0.999 | 1.993 | 2.976 |
| 0.0330000000000026 | 0.999 | 1.991 | 2.971 |
| 0.0360000000000026 | 0.999 | 1.99 | 2.965 |
| 0.0390000000000026 | 0.998 | 1.988 | 2.959 |
| 0.0420000000000026 | 0.998 | 1.986 | 2.953 |
| 0.0450000000000026 | 0.998 | 1.984 | 2.946 |
| 0.0480000000000026 | 0.998 | 1.982 | 2.939 |
| 0.0510000000000026 | 0.997 | 1.979 | 2.931 |
| 0.0540000000000026 | 0.997 | 1.977 | 2.923 |
| 0.0570000000000026 | 0.997 | 1.974 | 2.915 |
| 0.0600000000000026 | 0.996 | 1.972 | 2.906 |
| 0.0630000000000026 | 0.996 | 1.969 | 2.897 |
| 0.0660000000000026 | 0.996 | 1.966 | 2.887 |
| 0.0690000000000026 | 0.995 | 1.963 | 2.877 |
| 0.0720000000000027 | 0.995 | 1.959 | 2.866 |
| 0.0750000000000027 | 0.994 | 1.956 | 2.855 |
| 0.0780000000000027 | 0.994 | 1.952 | 2.844 |
| 0.0810000000000027 | 0.993 | 1.949 | 2.833 |
| 0.0840000000000027 | 0.993 | 1.945 | 2.821 |
| 0.0870000000000027 | 0.992 | 1.941 | 2.809 |
| 0.0900000000000027 | 0.992 | 1.937 | 2.796 |
| 0.0930000000000027 | 0.991 | 1.933 | 2.783 |
| 0.0960000000000027 | 0.991 | 1.929 | 2.77 |
| 0.0990000000000027 | 0.99 | 1.925 | 2.757 |
| 0.102000000000003 | 0.99 | 1.92 | 2.743 |
| 0.105000000000003 | 0.989 | 1.916 | 2.729 |
| 0.108000000000003 | 0.988 | 1.911 | 2.715 |
| 0.111000000000003 | 0.988 | 1.906 | 2.701 |
| 0.114000000000003 | 0.987 | 1.901 | 2.686 |
| 0.117000000000003 | 0.986 | 1.896 | 2.671 |
| 0.120000000000003 | 0.986 | 1.891 | 2.656 |
| 0.123000000000003 | 0.985 | 1.886 | 2.64 |
| 0.126000000000003 | 0.984 | 1.881 | 2.625 |
| 0.129000000000003 | 0.984 | 1.875 | 2.609 |
| 0.132000000000003 | 0.983 | 1.87 | 2.593 |
| 0.135000000000003 | 0.982 | 1.864 | 2.577 |
| 0.138000000000003 | 0.981 | 1.858 | 2.561 |
| 0.141000000000003 | 0.981 | 1.853 | 2.545 |
| 0.144000000000003 | 0.98 | 1.847 | 2.528 |
| 0.147000000000003 | 0.979 | 1.841 | 2.512 |
| 0.150000000000003 | 0.978 | 1.835 | 2.495 |
| 0.153000000000003 | 0.977 | 1.829 | 2.478 |
| 0.156000000000003 | 0.976 | 1.823 | 2.461 |
| 0.159000000000003 | 0.975 | 1.816 | 2.444 |
| 0.162000000000003 | 0.974 | 1.81 | 2.427 |
| 0.165000000000003 | 0.973 | 1.804 | 2.41 |
| 0.168000000000003 | 0.973 | 1.797 | 2.392 |
| 0.171000000000003 | 0.972 | 1.791 | 2.375 |
| 0.174000000000003 | 0.971 | 1.784 | 2.358 |
| 0.177000000000003 | 0.97 | 1.777 | 2.34 |
| 0.180000000000003 | 0.969 | 1.771 | 2.323 |
| 0.183000000000003 | 0.968 | 1.764 | 2.305 |
| 0.186000000000003 | 0.967 | 1.757 | 2.288 |
| 0.189000000000003 | 0.966 | 1.75 | 2.27 |
| 0.192000000000003 | 0.964 | 1.743 | 2.253 |
| 0.195000000000003 | 0.963 | 1.736 | 2.235 |
| 0.198000000000003 | 0.962 | 1.729 | 2.218 |
| 0.201000000000003 | 0.961 | 1.722 | 2.2 |
| 0.204000000000003 | 0.96 | 1.715 | 2.183 |
| 0.207000000000003 | 0.959 | 1.707 | 2.165 |
| 0.210000000000003 | 0.958 | 1.7 | 2.148 |
| 0.213000000000003 | 0.957 | 1.693 | 2.13 |
| 0.216000000000003 | 0.955 | 1.685 | 2.113 |
| 0.219000000000003 | 0.954 | 1.678 | 2.095 |
| 0.222000000000003 | 0.953 | 1.671 | 2.078 |
| 0.225000000000003 | 0.952 | 1.663 | 2.061 |
| 0.228000000000003 | 0.951 | 1.656 | 2.044 |
| 0.231000000000003 | 0.949 | 1.648 | 2.027 |
| 0.234000000000003 | 0.948 | 1.641 | 2.01 |
| 0.237000000000003 | 0.947 | 1.633 | 1.993 |
| 0.240000000000003 | 0.946 | 1.625 | 1.976 |
| 0.243000000000003 | 0.944 | 1.618 | 1.959 |
| 0.246000000000003 | 0.943 | 1.61 | 1.942 |
| 0.249000000000003 | 0.942 | 1.603 | 1.926 |
| 0.252000000000003 | 0.94 | 1.595 | 1.909 |
| 0.255000000000003 | 0.939 | 1.587 | 1.892 |
| 0.258000000000003 | 0.938 | 1.579 | 1.876 |
| 0.261000000000003 | 0.936 | 1.572 | 1.86 |
| 0.264000000000003 | 0.935 | 1.564 | 1.844 |
| 0.267000000000003 | 0.933 | 1.556 | 1.827 |
| 0.270000000000003 | 0.932 | 1.548 | 1.811 |
| 0.273000000000003 | 0.931 | 1.541 | 1.796 |
| 0.276000000000003 | 0.929 | 1.533 | 1.78 |
| 0.279000000000003 | 0.928 | 1.525 | 1.764 |
| 0.282000000000003 | 0.926 | 1.517 | 1.749 |
| 0.285000000000003 | 0.925 | 1.51 | 1.733 |
| 0.288000000000003 | 0.923 | 1.502 | 1.718 |
| 0.291000000000003 | 0.922 | 1.494 | 1.702 |
| 0.294000000000003 | 0.92 | 1.486 | 1.687 |
| 0.297000000000003 | 0.919 | 1.478 | 1.672 |
| 0.300000000000003 | 0.917 | 1.471 | 1.657 |
| 0.303000000000003 | 0.916 | 1.463 | 1.643 |
| 0.306000000000003 | 0.914 | 1.455 | 1.628 |
| 0.309000000000003 | 0.913 | 1.447 | 1.613 |
| 0.312000000000003 | 0.911 | 1.439 | 1.599 |
| 0.315000000000003 | 0.91 | 1.432 | 1.585 |
| 0.318000000000003 | 0.908 | 1.424 | 1.571 |
| 0.321000000000003 | 0.907 | 1.416 | 1.557 |
| 0.324000000000003 | 0.905 | 1.409 | 1.543 |
| 0.327000000000003 | 0.903 | 1.401 | 1.529 |
| 0.330000000000003 | 0.902 | 1.393 | 1.515 |
| 0.333000000000003 | 0.9 | 1.385 | 1.502 |
| 0.336000000000003 | 0.899 | 1.378 | 1.488 |
| 0.339000000000003 | 0.897 | 1.37 | 1.475 |
| 0.342000000000003 | 0.895 | 1.363 | 1.462 |
| 0.345000000000003 | 0.894 | 1.355 | 1.448 |
| 0.348000000000003 | 0.892 | 1.347 | 1.435 |
| 0.351000000000003 | 0.89 | 1.34 | 1.423 |
| 0.354000000000003 | 0.889 | 1.332 | 1.41 |
| 0.357000000000003 | 0.887 | 1.325 | 1.397 |
| 0.360000000000003 | 0.885 | 1.317 | 1.385 |
| 0.363000000000003 | 0.884 | 1.31 | 1.372 |
| 0.366000000000003 | 0.882 | 1.302 | 1.36 |
| 0.369000000000003 | 0.88 | 1.295 | 1.348 |
| 0.372000000000003 | 0.878 | 1.287 | 1.336 |
| 0.375000000000003 | 0.877 | 1.28 | 1.324 |
| 0.378000000000003 | 0.875 | 1.273 | 1.312 |
| 0.381000000000003 | 0.873 | 1.265 | 1.301 |
| 0.384000000000003 | 0.871 | 1.258 | 1.289 |
| 0.387000000000003 | 0.87 | 1.251 | 1.278 |
| 0.390000000000003 | 0.868 | 1.243 | 1.266 |
| 0.393000000000003 | 0.866 | 1.236 | 1.255 |
| 0.396000000000003 | 0.864 | 1.229 | 1.244 |
| 0.399000000000003 | 0.863 | 1.222 | 1.233 |
| 0.402000000000003 | 0.861 | 1.215 | 1.222 |
| 0.405000000000003 | 0.859 | 1.208 | 1.212 |
| 0.408000000000003 | 0.857 | 1.201 | 1.201 |
| 0.411000000000003 | 0.855 | 1.194 | 1.19 |
| 0.414000000000003 | 0.854 | 1.187 | 1.18 |
| 0.417000000000003 | 0.852 | 1.18 | 1.17 |
| 0.420000000000003 | 0.85 | 1.173 | 1.159 |
| 0.423000000000003 | 0.848 | 1.166 | 1.149 |
| 0.426000000000003 | 0.846 | 1.159 | 1.139 |
| 0.429000000000003 | 0.845 | 1.152 | 1.129 |
| 0.432000000000003 | 0.843 | 1.145 | 1.12 |
| 0.435000000000003 | 0.841 | 1.138 | 1.11 |
| 0.438000000000003 | 0.839 | 1.132 | 1.1 |
| 0.441000000000003 | 0.837 | 1.125 | 1.091 |
| 0.444000000000003 | 0.835 | 1.118 | 1.081 |
| 0.447000000000003 | 0.833 | 1.112 | 1.072 |
| 0.450000000000003 | 0.832 | 1.105 | 1.063 |
| 0.453000000000003 | 0.83 | 1.098 | 1.054 |
| 0.456000000000003 | 0.828 | 1.092 | 1.045 |
| 0.459000000000003 | 0.826 | 1.085 | 1.036 |
| 0.462000000000003 | 0.824 | 1.079 | 1.027 |
| 0.465000000000003 | 0.822 | 1.072 | 1.018 |
| 0.468000000000003 | 0.82 | 1.066 | 1.01 |
| 0.471000000000003 | 0.818 | 1.06 | 1.001 |
| 0.474000000000003 | 0.817 | 1.053 | 0.993 |
| 0.477000000000003 | 0.815 | 1.047 | 0.984 |
| 0.480000000000003 | 0.813 | 1.041 | 0.976 |
| 0.483000000000003 | 0.811 | 1.035 | 0.968 |
| 0.486000000000003 | 0.809 | 1.028 | 0.96 |
| 0.489000000000003 | 0.807 | 1.022 | 0.952 |
| 0.492000000000003 | 0.805 | 1.016 | 0.944 |
| 0.495000000000003 | 0.803 | 1.01 | 0.936 |
| 0.498000000000003 | 0.801 | 1.004 | 0.928 |
| 0.501000000000003 | 0.799 | 0.998 | 0.921 |
| 0.504000000000003 | 0.797 | 0.992 | 0.913 |
| 0.507000000000003 | 0.796 | 0.986 | 0.905 |
| 0.510000000000003 | 0.794 | 0.98 | 0.898 |
| 0.513000000000003 | 0.792 | 0.974 | 0.891 |
| 0.516000000000003 | 0.79 | 0.969 | 0.883 |
| 0.519000000000003 | 0.788 | 0.963 | 0.876 |
| 0.522000000000003 | 0.786 | 0.957 | 0.869 |
| 0.525000000000003 | 0.784 | 0.951 | 0.862 |
| 0.528000000000003 | 0.782 | 0.946 | 0.855 |
| 0.531000000000003 | 0.78 | 0.94 | 0.848 |
| 0.534000000000003 | 0.778 | 0.934 | 0.841 |
| 0.537000000000003 | 0.776 | 0.929 | 0.834 |
| 0.540000000000003 | 0.774 | 0.923 | 0.828 |
| 0.543000000000003 | 0.772 | 0.918 | 0.821 |
| 0.546000000000003 | 0.77 | 0.912 | 0.815 |
| 0.549000000000003 | 0.768 | 0.907 | 0.808 |
| 0.552000000000003 | 0.766 | 0.901 | 0.802 |
| 0.555000000000003 | 0.765 | 0.896 | 0.795 |
| 0.558000000000003 | 0.763 | 0.891 | 0.789 |
| 0.561000000000003 | 0.761 | 0.885 | 0.783 |
| 0.564000000000003 | 0.759 | 0.88 | 0.777 |
| 0.567000000000003 | 0.757 | 0.875 | 0.771 |
| 0.570000000000003 | 0.755 | 0.87 | 0.765 |
| 0.573000000000003 | 0.753 | 0.865 | 0.759 |
| 0.576000000000003 | 0.751 | 0.859 | 0.753 |
| 0.579000000000003 | 0.749 | 0.854 | 0.747 |
| 0.582000000000003 | 0.747 | 0.849 | 0.741 |
| 0.585000000000003 | 0.745 | 0.844 | 0.735 |
| 0.588000000000003 | 0.743 | 0.839 | 0.73 |
| 0.591000000000003 | 0.741 | 0.834 | 0.724 |
| 0.594000000000003 | 0.739 | 0.829 | 0.718 |
| 0.597000000000003 | 0.737 | 0.825 | 0.713 |
| 0.600000000000003 | 0.735 | 0.82 | 0.708 |
| 0.603000000000003 | 0.733 | 0.815 | 0.702 |
| 0.606000000000003 | 0.731 | 0.81 | 0.697 |
| 0.609000000000003 | 0.729 | 0.805 | 0.692 |
| 0.612000000000003 | 0.728 | 0.801 | 0.686 |
| 0.615000000000003 | 0.726 | 0.796 | 0.681 |
| 0.618000000000003 | 0.724 | 0.791 | 0.676 |
| 0.621000000000003 | 0.722 | 0.787 | 0.671 |
| 0.624000000000003 | 0.72 | 0.782 | 0.666 |
| 0.627000000000003 | 0.718 | 0.777 | 0.661 |
| 0.630000000000003 | 0.716 | 0.773 | 0.656 |
| 0.633000000000003 | 0.714 | 0.768 | 0.651 |
| 0.636000000000003 | 0.712 | 0.764 | 0.646 |
| 0.639000000000003 | 0.71 | 0.76 | 0.642 |
| 0.642000000000003 | 0.708 | 0.755 | 0.637 |
| 0.645000000000003 | 0.706 | 0.751 | 0.632 |
| 0.648000000000003 | 0.704 | 0.746 | 0.628 |
| 0.651000000000003 | 0.702 | 0.742 | 0.623 |
| 0.654000000000003 | 0.7 | 0.738 | 0.619 |
| 0.657000000000003 | 0.698 | 0.734 | 0.614 |
| 0.660000000000003 | 0.697 | 0.729 | 0.61 |
| 0.663000000000003 | 0.695 | 0.725 | 0.605 |
| 0.666000000000003 | 0.693 | 0.721 | 0.601 |
| 0.669000000000003 | 0.691 | 0.717 | 0.597 |
| 0.672000000000003 | 0.689 | 0.713 | 0.592 |
| 0.675000000000003 | 0.687 | 0.709 | 0.588 |
| 0.678000000000003 | 0.685 | 0.705 | 0.584 |
| 0.681000000000003 | 0.683 | 0.701 | 0.58 |
| 0.684000000000003 | 0.681 | 0.697 | 0.576 |
| 0.687000000000003 | 0.679 | 0.693 | 0.572 |
| 0.690000000000003 | 0.677 | 0.689 | 0.568 |
| 0.693000000000003 | 0.676 | 0.685 | 0.564 |
| 0.696000000000003 | 0.674 | 0.681 | 0.56 |
| 0.699000000000003 | 0.672 | 0.677 | 0.556 |
| 0.702000000000003 | 0.67 | 0.673 | 0.552 |
| 0.705000000000003 | 0.668 | 0.669 | 0.548 |
| 0.708000000000003 | 0.666 | 0.666 | 0.544 |
| 0.711000000000003 | 0.664 | 0.662 | 0.541 |
| 0.714000000000003 | 0.662 | 0.658 | 0.537 |
| 0.717000000000003 | 0.66 | 0.654 | 0.533 |
| 0.720000000000003 | 0.659 | 0.651 | 0.53 |
| 0.723000000000003 | 0.657 | 0.647 | 0.526 |
| 0.726000000000003 | 0.655 | 0.643 | 0.522 |
| 0.729000000000003 | 0.653 | 0.64 | 0.519 |
| 0.732000000000003 | 0.651 | 0.636 | 0.515 |
| 0.735000000000003 | 0.649 | 0.633 | 0.512 |
| 0.738000000000003 | 0.647 | 0.629 | 0.508 |
| 0.741000000000003 | 0.646 | 0.626 | 0.505 |
| 0.744000000000003 | 0.644 | 0.622 | 0.502 |
| 0.747000000000003 | 0.642 | 0.619 | 0.498 |
| 0.750000000000003 | 0.64 | 0.615 | 0.495 |
| 0.753000000000003 | 0.638 | 0.612 | 0.492 |
| 0.756000000000003 | 0.636 | 0.609 | 0.488 |
| 0.759000000000003 | 0.634 | 0.605 | 0.485 |
| 0.762000000000003 | 0.633 | 0.602 | 0.482 |
| 0.765000000000003 | 0.631 | 0.599 | 0.479 |
| 0.768000000000003 | 0.629 | 0.595 | 0.476 |
| 0.771000000000003 | 0.627 | 0.592 | 0.472 |
| 0.774000000000003 | 0.625 | 0.589 | 0.469 |
| 0.777000000000003 | 0.624 | 0.586 | 0.466 |
| 0.780000000000003 | 0.622 | 0.582 | 0.463 |
| 0.783000000000003 | 0.62 | 0.579 | 0.46 |
| 0.786000000000003 | 0.618 | 0.576 | 0.457 |
| 0.789000000000003 | 0.616 | 0.573 | 0.454 |
| 0.792000000000003 | 0.615 | 0.57 | 0.451 |
| 0.795000000000003 | 0.613 | 0.567 | 0.449 |
| 0.798000000000003 | 0.611 | 0.564 | 0.446 |
| 0.801000000000003 | 0.609 | 0.561 | 0.443 |
| 0.804000000000003 | 0.607 | 0.558 | 0.44 |
| 0.807000000000003 | 0.606 | 0.555 | 0.437 |
| 0.810000000000003 | 0.604 | 0.552 | 0.434 |
| 0.813000000000003 | 0.602 | 0.549 | 0.432 |
| 0.816000000000003 | 0.6 | 0.546 | 0.429 |
| 0.819000000000003 | 0.599 | 0.543 | 0.426 |
| 0.822000000000003 | 0.597 | 0.54 | 0.424 |
| 0.825000000000003 | 0.595 | 0.537 | 0.421 |
| 0.828000000000003 | 0.593 | 0.534 | 0.418 |
| 0.831000000000003 | 0.592 | 0.532 | 0.416 |
| 0.834000000000003 | 0.59 | 0.529 | 0.413 |
| 0.837000000000003 | 0.588 | 0.526 | 0.411 |
| 0.840000000000003 | 0.586 | 0.523 | 0.408 |
| 0.843000000000003 | 0.585 | 0.52 | 0.406 |
| 0.846000000000003 | 0.583 | 0.518 | 0.403 |
| 0.849000000000003 | 0.581 | 0.515 | 0.401 |
| 0.852000000000003 | 0.579 | 0.512 | 0.398 |
| 0.855000000000003 | 0.578 | 0.51 | 0.396 |
| 0.858000000000003 | 0.576 | 0.507 | 0.393 |
| 0.861000000000003 | 0.574 | 0.504 | 0.391 |
| 0.864000000000003 | 0.573 | 0.502 | 0.389 |
| 0.867000000000003 | 0.571 | 0.499 | 0.386 |
| 0.870000000000003 | 0.569 | 0.497 | 0.384 |
| 0.873000000000003 | 0.567 | 0.494 | 0.382 |
| 0.876000000000003 | 0.566 | 0.491 | 0.379 |
| 0.879000000000003 | 0.564 | 0.489 | 0.377 |
| 0.882000000000003 | 0.562 | 0.486 | 0.375 |
| 0.885000000000003 | 0.561 | 0.484 | 0.373 |
| 0.888000000000003 | 0.559 | 0.481 | 0.371 |
| 0.891000000000003 | 0.557 | 0.479 | 0.368 |
| 0.894000000000003 | 0.556 | 0.477 | 0.366 |
| 0.897000000000003 | 0.554 | 0.474 | 0.364 |
| 0.900000000000003 | 0.552 | 0.472 | 0.362 |
| 0.903000000000003 | 0.551 | 0.469 | 0.36 |
| 0.906000000000003 | 0.549 | 0.467 | 0.358 |
| 0.909000000000003 | 0.548 | 0.465 | 0.356 |
| 0.912000000000003 | 0.546 | 0.462 | 0.354 |
| 0.915000000000003 | 0.544 | 0.46 | 0.351 |
| 0.918000000000003 | 0.543 | 0.458 | 0.349 |
| 0.921000000000003 | 0.541 | 0.455 | 0.347 |
| 0.924000000000003 | 0.539 | 0.453 | 0.345 |
| 0.927000000000003 | 0.538 | 0.451 | 0.343 |
| 0.930000000000003 | 0.536 | 0.448 | 0.342 |
| 0.933000000000003 | 0.535 | 0.446 | 0.34 |
| 0.936000000000003 | 0.533 | 0.444 | 0.338 |
| 0.939000000000003 | 0.531 | 0.442 | 0.336 |
| 0.942000000000003 | 0.53 | 0.44 | 0.334 |
| 0.945000000000003 | 0.528 | 0.437 | 0.332 |
| 0.948000000000003 | 0.527 | 0.435 | 0.33 |
| 0.951000000000003 | 0.525 | 0.433 | 0.328 |
| 0.954000000000003 | 0.524 | 0.431 | 0.326 |
| 0.957000000000003 | 0.522 | 0.429 | 0.325 |
| 0.960000000000003 | 0.52 | 0.427 | 0.323 |
| 0.963000000000003 | 0.519 | 0.425 | 0.321 |
| 0.966000000000003 | 0.517 | 0.423 | 0.319 |
| 0.969000000000003 | 0.516 | 0.421 | 0.317 |
| 0.972000000000003 | 0.514 | 0.418 | 0.316 |
| 0.975000000000003 | 0.513 | 0.416 | 0.314 |
| 0.978000000000003 | 0.511 | 0.414 | 0.312 |
| 0.981000000000003 | 0.51 | 0.412 | 0.311 |
| 0.984000000000003 | 0.508 | 0.41 | 0.309 |
| 0.987000000000003 | 0.507 | 0.408 | 0.307 |
| 0.990000000000003 | 0.505 | 0.406 | 0.305 |
| 0.993000000000003 | 0.504 | 0.405 | 0.304 |
| 0.996000000000003 | 0.502 | 0.403 | 0.302 |
| 0.999000000000003 | 0.501 | 0.401 | 0.301 |
| 1.002000000000003 | 0.499 | 0.399 | 0.299 |
| 1.005000000000003 | 0.498 | 0.397 | 0.297 |
| 1.008000000000003 | 0.496 | 0.395 | 0.296 |
| 1.011000000000003 | 0.495 | 0.393 | 0.294 |
| 1.014000000000003 | 0.493 | 0.391 | 0.293 |
| 1.017000000000003 | 0.492 | 0.389 | 0.291 |
| 1.020000000000003 | 0.49 | 0.387 | 0.289 |
| 1.023000000000003 | 0.489 | 0.386 | 0.288 |
| 1.026000000000002 | 0.487 | 0.384 | 0.286 |
| 1.029000000000002 | 0.486 | 0.382 | 0.285 |
| 1.032000000000002 | 0.484 | 0.38 | 0.283 |
| 1.035000000000002 | 0.483 | 0.378 | 0.282 |
| 1.038000000000002 | 0.481 | 0.377 | 0.28 |
| 1.041000000000002 | 0.48 | 0.375 | 0.279 |
| 1.044000000000002 | 0.478 | 0.373 | 0.278 |
| 1.047000000000002 | 0.477 | 0.371 | 0.276 |
| 1.050000000000002 | 0.476 | 0.37 | 0.275 |
| 1.053000000000001 | 0.474 | 0.368 | 0.273 |
| 1.056000000000001 | 0.473 | 0.366 | 0.272 |
| 1.059000000000001 | 0.471 | 0.365 | 0.27 |
| 1.062000000000001 | 0.47 | 0.363 | 0.269 |
| 1.065000000000001 | 0.469 | 0.361 | 0.268 |
| 1.068000000000001 | 0.467 | 0.36 | 0.266 |
| 1.071000000000001 | 0.466 | 0.358 | 0.265 |
| 1.074000000000001 | 0.464 | 0.356 | 0.264 |
| 1.077000000000001 | 0.463 | 0.355 | 0.262 |
| 1.08 | 0.462 | 0.353 | 0.261 |
| 1.083 | 0.46 | 0.351 | 0.26 |
| 1.086 | 0.459 | 0.35 | 0.258 |
| 1.089 | 0.457 | 0.348 | 0.257 |
| 1.092 | 0.456 | 0.347 | 0.256 |
| 1.095 | 0.455 | 0.345 | 0.254 |
| 1.098 | 0.453 | 0.344 | 0.253 |
| 1.101 | 0.452 | 0.342 | 0.252 |
| 1.104 | 0.451 | 0.34 | 0.251 |
| 1.107 | 0.449 | 0.339 | 0.249 |
| 1.109999999999999 | 0.448 | 0.337 | 0.248 |
| 1.112999999999999 | 0.447 | 0.336 | 0.247 |
| 1.115999999999999 | 0.445 | 0.334 | 0.246 |
| 1.118999999999999 | 0.444 | 0.333 | 0.245 |
| 1.121999999999999 | 0.443 | 0.331 | 0.243 |
| 1.124999999999999 | 0.441 | 0.33 | 0.242 |
| 1.127999999999999 | 0.44 | 0.328 | 0.241 |
| 1.130999999999999 | 0.439 | 0.327 | 0.24 |
| 1.133999999999999 | 0.437 | 0.326 | 0.239 |
| 1.136999999999998 | 0.436 | 0.324 | 0.237 |
| 1.139999999999998 | 0.435 | 0.323 | 0.236 |
| 1.142999999999998 | 0.434 | 0.321 | 0.235 |
| 1.145999999999998 | 0.432 | 0.32 | 0.234 |
| 1.148999999999998 | 0.431 | 0.318 | 0.233 |
| 1.151999999999998 | 0.43 | 0.317 | 0.232 |
| 1.154999999999998 | 0.428 | 0.316 | 0.231 |
| 1.157999999999998 | 0.427 | 0.314 | 0.23 |
| 1.160999999999998 | 0.426 | 0.313 | 0.228 |
| 1.163999999999997 | 0.425 | 0.312 | 0.227 |
| 1.166999999999997 | 0.423 | 0.31 | 0.226 |
| 1.169999999999997 | 0.422 | 0.309 | 0.225 |
| 1.172999999999997 | 0.421 | 0.308 | 0.224 |
| 1.175999999999997 | 0.42 | 0.306 | 0.223 |
| 1.178999999999997 | 0.418 | 0.305 | 0.222 |
| 1.181999999999997 | 0.417 | 0.304 | 0.221 |
| 1.184999999999997 | 0.416 | 0.302 | 0.22 |
| 1.187999999999997 | 0.415 | 0.301 | 0.219 |
| 1.190999999999996 | 0.413 | 0.3 | 0.218 |
| 1.193999999999996 | 0.412 | 0.298 | 0.217 |
| 1.196999999999996 | 0.411 | 0.297 | 0.216 |
| 1.199999999999996 | 0.41 | 0.296 | 0.215 |
| 1.202999999999996 | 0.409 | 0.295 | 0.214 |
| 1.205999999999996 | 0.407 | 0.293 | 0.213 |
| 1.208999999999996 | 0.406 | 0.292 | 0.212 |
| 1.211999999999996 | 0.405 | 0.291 | 0.211 |
| 1.214999999999996 | 0.404 | 0.29 | 0.21 |
| 1.217999999999996 | 0.403 | 0.288 | 0.209 |
| 1.220999999999995 | 0.401 | 0.287 | 0.208 |
| 1.223999999999995 | 0.4 | 0.286 | 0.207 |
| 1.226999999999995 | 0.399 | 0.285 | 0.206 |
| 1.229999999999995 | 0.398 | 0.284 | 0.205 |
| 1.232999999999995 | 0.397 | 0.282 | 0.204 |
| 1.235999999999995 | 0.396 | 0.281 | 0.203 |
| 1.238999999999995 | 0.394 | 0.28 | 0.202 |
| 1.241999999999995 | 0.393 | 0.279 | 0.202 |
| 1.244999999999995 | 0.392 | 0.278 | 0.201 |
| 1.247999999999994 | 0.391 | 0.277 | 0.2 |
| 1.250999999999994 | 0.39 | 0.275 | 0.199 |
| 1.253999999999994 | 0.389 | 0.274 | 0.198 |
| 1.256999999999994 | 0.388 | 0.273 | 0.197 |
| 1.259999999999994 | 0.386 | 0.272 | 0.196 |
| 1.262999999999994 | 0.385 | 0.271 | 0.195 |
| 1.265999999999994 | 0.384 | 0.27 | 0.194 |
| 1.268999999999994 | 0.383 | 0.269 | 0.194 |
| 1.271999999999994 | 0.382 | 0.268 | 0.193 |
| 1.274999999999993 | 0.381 | 0.267 | 0.192 |
| 1.277999999999993 | 0.38 | 0.265 | 0.191 |
| 1.280999999999993 | 0.379 | 0.264 | 0.19 |
| 1.283999999999993 | 0.378 | 0.263 | 0.189 |
| 1.286999999999993 | 0.376 | 0.262 | 0.189 |
| 1.289999999999993 | 0.375 | 0.261 | 0.188 |
| 1.292999999999993 | 0.374 | 0.26 | 0.187 |
| 1.295999999999993 | 0.373 | 0.259 | 0.186 |
| 1.298999999999993 | 0.372 | 0.258 | 0.185 |
| 1.301999999999992 | 0.371 | 0.257 | 0.185 |
| 1.304999999999992 | 0.37 | 0.256 | 0.184 |
| 1.307999999999992 | 0.369 | 0.255 | 0.183 |
| 1.310999999999992 | 0.368 | 0.254 | 0.182 |
| 1.313999999999992 | 0.367 | 0.253 | 0.181 |
| 1.316999999999992 | 0.366 | 0.252 | 0.181 |
| 1.319999999999992 | 0.365 | 0.251 | 0.18 |
| 1.322999999999992 | 0.364 | 0.25 | 0.179 |
| 1.325999999999992 | 0.363 | 0.249 | 0.178 |
| 1.328999999999991 | 0.362 | 0.248 | 0.178 |
| 1.331999999999991 | 0.36 | 0.247 | 0.177 |
| 1.334999999999991 | 0.359 | 0.246 | 0.176 |
| 1.337999999999991 | 0.358 | 0.245 | 0.175 |
| 1.340999999999991 | 0.357 | 0.244 | 0.175 |
| 1.343999999999991 | 0.356 | 0.243 | 0.174 |
| 1.346999999999991 | 0.355 | 0.242 | 0.173 |
| 1.349999999999991 | 0.354 | 0.241 | 0.172 |
| 1.352999999999991 | 0.353 | 0.24 | 0.172 |
| 1.35599999999999 | 0.352 | 0.239 | 0.171 |
| 1.35899999999999 | 0.351 | 0.238 | 0.17 |
| 1.36199999999999 | 0.35 | 0.238 | 0.17 |
| 1.36499999999999 | 0.349 | 0.237 | 0.169 |
| 1.36799999999999 | 0.348 | 0.236 | 0.168 |
| 1.37099999999999 | 0.347 | 0.235 | 0.167 |
| 1.37399999999999 | 0.346 | 0.234 | 0.167 |
| 1.37699999999999 | 0.345 | 0.233 | 0.166 |
| 1.37999999999999 | 0.344 | 0.232 | 0.165 |
| 1.38299999999999 | 0.343 | 0.231 | 0.165 |
| 1.385999999999989 | 0.342 | 0.23 | 0.164 |
| 1.388999999999989 | 0.341 | 0.229 | 0.163 |
| 1.391999999999989 | 0.34 | 0.229 | 0.163 |
| 1.394999999999989 | 0.339 | 0.228 | 0.162 |
| 1.397999999999989 | 0.338 | 0.227 | 0.161 |
| 1.400999999999989 | 0.338 | 0.226 | 0.161 |
| 1.403999999999989 | 0.337 | 0.225 | 0.16 |
| 1.406999999999989 | 0.336 | 0.224 | 0.159 |
| 1.409999999999989 | 0.335 | 0.223 | 0.159 |
| 1.412999999999988 | 0.334 | 0.223 | 0.158 |
| 1.415999999999988 | 0.333 | 0.222 | 0.158 |
| 1.418999999999988 | 0.332 | 0.221 | 0.157 |
| 1.421999999999988 | 0.331 | 0.22 | 0.156 |
| 1.424999999999988 | 0.33 | 0.219 | 0.156 |
| 1.427999999999988 | 0.329 | 0.218 | 0.155 |
| 1.430999999999988 | 0.328 | 0.218 | 0.154 |
| 1.433999999999988 | 0.327 | 0.217 | 0.154 |
| 1.436999999999988 | 0.326 | 0.216 | 0.153 |
| 1.439999999999987 | 0.325 | 0.215 | 0.153 |
| 1.442999999999987 | 0.324 | 0.214 | 0.152 |
| 1.445999999999987 | 0.324 | 0.214 | 0.151 |
| 1.448999999999987 | 0.323 | 0.213 | 0.151 |
| 1.451999999999987 | 0.322 | 0.212 | 0.15 |
| 1.454999999999987 | 0.321 | 0.211 | 0.15 |
| 1.457999999999987 | 0.32 | 0.21 | 0.149 |
| 1.460999999999987 | 0.319 | 0.21 | 0.148 |
| 1.463999999999987 | 0.318 | 0.209 | 0.148 |
| 1.466999999999987 | 0.317 | 0.208 | 0.147 |
| 1.469999999999986 | 0.316 | 0.207 | 0.147 |
| 1.472999999999986 | 0.315 | 0.207 | 0.146 |
| 1.475999999999986 | 0.315 | 0.206 | 0.146 |
| 1.478999999999986 | 0.314 | 0.205 | 0.145 |
| 1.481999999999986 | 0.313 | 0.204 | 0.144 |
| 1.484999999999986 | 0.312 | 0.204 | 0.144 |
| 1.487999999999986 | 0.311 | 0.203 | 0.143 |
| 1.490999999999986 | 0.31 | 0.202 | 0.143 |
| 1.493999999999986 | 0.309 | 0.201 | 0.142 |
| 1.496999999999985 | 0.309 | 0.201 | 0.142 |
| 1.499999999999985 | 0.308 | 0.2 | 0.141 |
| 1.502999999999985 | 0.307 | 0.199 | 0.141 |
| 1.505999999999985 | 0.306 | 0.199 | 0.14 |
| 1.508999999999985 | 0.305 | 0.198 | 0.14 |
| 1.511999999999985 | 0.304 | 0.197 | 0.139 |
| 1.514999999999985 | 0.303 | 0.196 | 0.139 |
| 1.517999999999985 | 0.303 | 0.196 | 0.138 |
| 1.520999999999985 | 0.302 | 0.195 | 0.137 |
| 1.523999999999984 | 0.301 | 0.194 | 0.137 |
| 1.526999999999984 | 0.3 | 0.194 | 0.136 |
| 1.529999999999984 | 0.299 | 0.193 | 0.136 |
| 1.532999999999984 | 0.298 | 0.192 | 0.135 |
| 1.535999999999984 | 0.298 | 0.192 | 0.135 |
| 1.538999999999984 | 0.297 | 0.191 | 0.134 |
| 1.541999999999984 | 0.296 | 0.19 | 0.134 |
| 1.544999999999984 | 0.295 | 0.19 | 0.133 |
| 1.547999999999984 | 0.294 | 0.189 | 0.133 |
| 1.550999999999983 | 0.294 | 0.188 | 0.132 |
| 1.553999999999983 | 0.293 | 0.188 | 0.132 |
| 1.556999999999983 | 0.292 | 0.187 | 0.131 |
| 1.559999999999983 | 0.291 | 0.186 | 0.131 |
| 1.562999999999983 | 0.29 | 0.186 | 0.131 |
| 1.565999999999983 | 0.29 | 0.185 | 0.13 |
| 1.568999999999983 | 0.289 | 0.184 | 0.13 |
| 1.571999999999983 | 0.288 | 0.184 | 0.129 |
| 1.574999999999983 | 0.287 | 0.183 | 0.129 |
| 1.577999999999983 | 0.287 | 0.182 | 0.128 |
| 1.580999999999982 | 0.286 | 0.182 | 0.128 |
| 1.583999999999982 | 0.285 | 0.181 | 0.127 |
| 1.586999999999982 | 0.284 | 0.181 | 0.127 |
| 1.589999999999982 | 0.283 | 0.18 | 0.126 |
| 1.592999999999982 | 0.283 | 0.179 | 0.126 |
| 1.595999999999982 | 0.282 | 0.179 | 0.125 |
| 1.598999999999982 | 0.281 | 0.178 | 0.125 |
| 1.601999999999982 | 0.28 | 0.178 | 0.124 |
| 1.604999999999981 | 0.28 | 0.177 | 0.124 |
| 1.607999999999981 | 0.279 | 0.176 | 0.124 |
| 1.610999999999981 | 0.278 | 0.176 | 0.123 |
| 1.613999999999981 | 0.277 | 0.175 | 0.123 |
| 1.616999999999981 | 0.277 | 0.175 | 0.122 |
| 1.619999999999981 | 0.276 | 0.174 | 0.122 |
| 1.622999999999981 | 0.275 | 0.173 | 0.121 |
| 1.625999999999981 | 0.274 | 0.173 | 0.121 |
| 1.628999999999981 | 0.274 | 0.172 | 0.121 |
| 1.63199999999998 | 0.273 | 0.172 | 0.12 |
| 1.63499999999998 | 0.272 | 0.171 | 0.12 |
| 1.63799999999998 | 0.272 | 0.17 | 0.119 |
| 1.64099999999998 | 0.271 | 0.17 | 0.119 |
| 1.64399999999998 | 0.27 | 0.169 | 0.118 |
| 1.64699999999998 | 0.269 | 0.169 | 0.118 |
| 1.64999999999998 | 0.269 | 0.168 | 0.118 |
| 1.65299999999998 | 0.268 | 0.168 | 0.117 |
| 1.65599999999998 | 0.267 | 0.167 | 0.117 |
| 1.65899999999998 | 0.267 | 0.167 | 0.116 |
| 1.661999999999979 | 0.266 | 0.166 | 0.116 |
| 1.664999999999979 | 0.265 | 0.165 | 0.116 |
| 1.667999999999979 | 0.264 | 0.165 | 0.115 |
| 1.670999999999979 | 0.264 | 0.164 | 0.115 |
| 1.673999999999979 | 0.263 | 0.164 | 0.114 |
| 1.676999999999979 | 0.262 | 0.163 | 0.114 |
| 1.679999999999979 | 0.262 | 0.163 | 0.114 |
| 1.682999999999979 | 0.261 | 0.162 | 0.113 |
| 1.685999999999979 | 0.26 | 0.162 | 0.113 |
| 1.688999999999978 | 0.26 | 0.161 | 0.112 |
| 1.691999999999978 | 0.259 | 0.161 | 0.112 |
| 1.694999999999978 | 0.258 | 0.16 | 0.112 |
| 1.697999999999978 | 0.258 | 0.16 | 0.111 |
| 1.700999999999978 | 0.257 | 0.159 | 0.111 |
| 1.703999999999978 | 0.256 | 0.159 | 0.111 |
| 1.706999999999978 | 0.256 | 0.158 | 0.11 |
| 1.709999999999978 | 0.255 | 0.158 | 0.11 |
| 1.712999999999978 | 0.254 | 0.157 | 0.109 |
| 1.715999999999977 | 0.254 | 0.157 | 0.109 |
| 1.718999999999977 | 0.253 | 0.156 | 0.109 |
| 1.721999999999977 | 0.252 | 0.156 | 0.108 |
| 1.724999999999977 | 0.252 | 0.155 | 0.108 |
| 1.727999999999977 | 0.251 | 0.155 | 0.108 |
| 1.730999999999977 | 0.25 | 0.154 | 0.107 |
| 1.733999999999977 | 0.25 | 0.154 | 0.107 |
| 1.736999999999977 | 0.249 | 0.153 | 0.107 |
| 1.739999999999977 | 0.248 | 0.153 | 0.106 |
| 1.742999999999976 | 0.248 | 0.152 | 0.106 |
| 1.745999999999976 | 0.247 | 0.152 | 0.105 |
| 1.748999999999976 | 0.246 | 0.151 | 0.105 |
| 1.751999999999976 | 0.246 | 0.151 | 0.105 |
| 1.754999999999976 | 0.245 | 0.15 | 0.104 |
| 1.757999999999976 | 0.244 | 0.15 | 0.104 |
| 1.760999999999976 | 0.244 | 0.149 | 0.104 |
| 1.763999999999976 | 0.243 | 0.149 | 0.103 |
| 1.766999999999976 | 0.243 | 0.148 | 0.103 |
| 1.769999999999976 | 0.242 | 0.148 | 0.103 |
| 1.772999999999975 | 0.241 | 0.147 | 0.102 |
| 1.775999999999975 | 0.241 | 0.147 | 0.102 |
| 1.778999999999975 | 0.24 | 0.146 | 0.102 |
| 1.781999999999975 | 0.239 | 0.146 | 0.101 |
| 1.784999999999975 | 0.239 | 0.146 | 0.101 |
| 1.787999999999975 | 0.238 | 0.145 | 0.101 |
| 1.790999999999975 | 0.238 | 0.145 | 0.1 |
| 1.793999999999975 | 0.237 | 0.144 | 0.1 |
| 1.796999999999975 | 0.236 | 0.144 | 0.1 |
| 1.799999999999974 | 0.236 | 0.143 | 0.099 |
| 1.802999999999974 | 0.235 | 0.143 | 0.099 |
| 1.805999999999974 | 0.235 | 0.142 | 0.099 |
| 1.808999999999974 | 0.234 | 0.142 | 0.099 |
| 1.811999999999974 | 0.233 | 0.142 | 0.098 |
| 1.814999999999974 | 0.233 | 0.141 | 0.098 |
| 1.817999999999974 | 0.232 | 0.141 | 0.098 |
| 1.820999999999974 | 0.232 | 0.14 | 0.097 |
| 1.823999999999974 | 0.231 | 0.14 | 0.097 |
| 1.826999999999973 | 0.231 | 0.139 | 0.097 |
| 1.829999999999973 | 0.23 | 0.139 | 0.096 |
| 1.832999999999973 | 0.229 | 0.139 | 0.096 |
| 1.835999999999973 | 0.229 | 0.138 | 0.096 |
| 1.838999999999973 | 0.228 | 0.138 | 0.095 |
| 1.841999999999973 | 0.228 | 0.137 | 0.095 |
| 1.844999999999973 | 0.227 | 0.137 | 0.095 |
| 1.847999999999973 | 0.226 | 0.136 | 0.095 |
| 1.850999999999973 | 0.226 | 0.136 | 0.094 |
| 1.853999999999973 | 0.225 | 0.136 | 0.094 |
| 1.856999999999972 | 0.225 | 0.135 | 0.094 |
| 1.859999999999972 | 0.224 | 0.135 | 0.093 |
| 1.862999999999972 | 0.224 | 0.134 | 0.093 |
| 1.865999999999972 | 0.223 | 0.134 | 0.093 |
| 1.868999999999972 | 0.223 | 0.134 | 0.092 |
| 1.871999999999972 | 0.222 | 0.133 | 0.092 |
| 1.874999999999972 | 0.221 | 0.133 | 0.092 |
| 1.877999999999972 | 0.221 | 0.132 | 0.092 |
| 1.880999999999972 | 0.22 | 0.132 | 0.091 |
| 1.883999999999971 | 0.22 | 0.132 | 0.091 |
| 1.886999999999971 | 0.219 | 0.131 | 0.091 |
| 1.889999999999971 | 0.219 | 0.131 | 0.091 |
| 1.892999999999971 | 0.218 | 0.13 | 0.09 |
| 1.895999999999971 | 0.218 | 0.13 | 0.09 |
| 1.898999999999971 | 0.217 | 0.13 | 0.09 |
| 1.901999999999971 | 0.217 | 0.129 | 0.089 |
| 1.904999999999971 | 0.216 | 0.129 | 0.089 |
| 1.907999999999971 | 0.215 | 0.129 | 0.089 |
| 1.91099999999997 | 0.215 | 0.128 | 0.089 |
| 1.91399999999997 | 0.214 | 0.128 | 0.088 |
| 1.91699999999997 | 0.214 | 0.127 | 0.088 |
| 1.91999999999997 | 0.213 | 0.127 | 0.088 |
| 1.92299999999997 | 0.213 | 0.127 | 0.088 |
| 1.92599999999997 | 0.212 | 0.126 | 0.087 |
| 1.92899999999997 | 0.212 | 0.126 | 0.087 |
| 1.93199999999997 | 0.211 | 0.126 | 0.087 |
| 1.93499999999997 | 0.211 | 0.125 | 0.086 |
| 1.937999999999969 | 0.21 | 0.125 | 0.086 |
| 1.940999999999969 | 0.21 | 0.124 | 0.086 |
| 1.943999999999969 | 0.209 | 0.124 | 0.086 |
| 1.946999999999969 | 0.209 | 0.124 | 0.085 |
| 1.949999999999969 | 0.208 | 0.123 | 0.085 |
| 1.952999999999969 | 0.208 | 0.123 | 0.085 |
| 1.955999999999969 | 0.207 | 0.123 | 0.085 |
| 1.958999999999969 | 0.207 | 0.122 | 0.084 |
| 1.961999999999969 | 0.206 | 0.122 | 0.084 |
| 1.964999999999969 | 0.206 | 0.122 | 0.084 |
| 1.967999999999968 | 0.205 | 0.121 | 0.084 |
| 1.970999999999968 | 0.205 | 0.121 | 0.083 |
| 1.973999999999968 | 0.204 | 0.121 | 0.083 |
| 1.976999999999968 | 0.204 | 0.12 | 0.083 |
| 1.979999999999968 | 0.203 | 0.12 | 0.083 |
| 1.982999999999968 | 0.203 | 0.12 | 0.082 |
| 1.985999999999968 | 0.202 | 0.119 | 0.082 |
| 1.988999999999968 | 0.202 | 0.119 | 0.082 |
| 1.991999999999968 | 0.201 | 0.119 | 0.082 |
| 1.994999999999967 | 0.201 | 0.118 | 0.081 |
| 1.997999999999967 | 0.2 | 0.118 | 0.081 |
| 2.000999999999967 | 0.2 | 0.118 | 0.081 |
| 2.003999999999968 | 0.199 | 0.117 | 0.081 |
| 2.006999999999968 | 0.199 | 0.117 | 0.081 |
| 2.009999999999968 | 0.198 | 0.117 | 0.08 |
| 2.012999999999968 | 0.198 | 0.116 | 0.08 |
| 2.015999999999968 | 0.197 | 0.116 | 0.08 |
| 2.018999999999968 | 0.197 | 0.116 | 0.08 |
| 2.021999999999968 | 0.197 | 0.115 | 0.079 |
| 2.024999999999968 | 0.196 | 0.115 | 0.079 |
| 2.027999999999968 | 0.196 | 0.115 | 0.079 |
| 2.030999999999969 | 0.195 | 0.114 | 0.079 |
| 2.033999999999969 | 0.195 | 0.114 | 0.078 |
| 2.036999999999969 | 0.194 | 0.114 | 0.078 |
| 2.039999999999969 | 0.194 | 0.113 | 0.078 |
| 2.042999999999969 | 0.193 | 0.113 | 0.078 |
| 2.045999999999969 | 0.193 | 0.113 | 0.078 |
| 2.048999999999969 | 0.192 | 0.112 | 0.077 |
| 2.051999999999969 | 0.192 | 0.112 | 0.077 |
| 2.05499999999997 | 0.191 | 0.112 | 0.077 |
| 2.05799999999997 | 0.191 | 0.111 | 0.077 |
| 2.06099999999997 | 0.191 | 0.111 | 0.076 |
| 2.06399999999997 | 0.19 | 0.111 | 0.076 |
| 2.06699999999997 | 0.19 | 0.111 | 0.076 |
| 2.06999999999997 | 0.189 | 0.11 | 0.076 |
| 2.07299999999997 | 0.189 | 0.11 | 0.076 |
| 2.07599999999997 | 0.188 | 0.11 | 0.075 |
| 2.07899999999997 | 0.188 | 0.109 | 0.075 |
| 2.081999999999971 | 0.187 | 0.109 | 0.075 |
| 2.084999999999971 | 0.187 | 0.109 | 0.075 |
| 2.087999999999971 | 0.187 | 0.108 | 0.075 |
| 2.090999999999971 | 0.186 | 0.108 | 0.074 |
| 2.093999999999971 | 0.186 | 0.108 | 0.074 |
| 2.096999999999971 | 0.185 | 0.108 | 0.074 |
| 2.099999999999971 | 0.185 | 0.107 | 0.074 |
| 2.102999999999971 | 0.184 | 0.107 | 0.074 |
| 2.105999999999971 | 0.184 | 0.107 | 0.073 |
| 2.108999999999972 | 0.184 | 0.106 | 0.073 |
| 2.111999999999972 | 0.183 | 0.106 | 0.073 |
| 2.114999999999972 | 0.183 | 0.106 | 0.073 |
| 2.117999999999972 | 0.182 | 0.106 | 0.073 |
| 2.120999999999972 | 0.182 | 0.105 | 0.072 |
| 2.123999999999972 | 0.181 | 0.105 | 0.072 |
| 2.126999999999972 | 0.181 | 0.105 | 0.072 |
| 2.129999999999972 | 0.181 | 0.104 | 0.072 |
| 2.132999999999972 | 0.18 | 0.104 | 0.072 |
| 2.135999999999973 | 0.18 | 0.104 | 0.071 |
| 2.138999999999973 | 0.179 | 0.104 | 0.071 |
| 2.141999999999973 | 0.179 | 0.103 | 0.071 |
| 2.144999999999973 | 0.179 | 0.103 | 0.071 |
| 2.147999999999973 | 0.178 | 0.103 | 0.071 |
| 2.150999999999973 | 0.178 | 0.103 | 0.07 |
| 2.153999999999973 | 0.177 | 0.102 | 0.07 |
| 2.156999999999973 | 0.177 | 0.102 | 0.07 |
| 2.159999999999973 | 0.177 | 0.102 | 0.07 |
| 2.162999999999974 | 0.176 | 0.101 | 0.07 |
| 2.165999999999974 | 0.176 | 0.101 | 0.069 |
| 2.168999999999974 | 0.175 | 0.101 | 0.069 |
| 2.171999999999974 | 0.175 | 0.101 | 0.069 |
| 2.174999999999974 | 0.175 | 0.1 | 0.069 |
| 2.177999999999974 | 0.174 | 0.1 | 0.069 |
| 2.180999999999974 | 0.174 | 0.1 | 0.068 |
| 2.183999999999974 | 0.173 | 0.1 | 0.068 |
| 2.186999999999974 | 0.173 | 0.099 | 0.068 |
| 2.189999999999975 | 0.173 | 0.099 | 0.068 |
| 2.192999999999975 | 0.172 | 0.099 | 0.068 |
| 2.195999999999975 | 0.172 | 0.099 | 0.068 |
| 2.198999999999975 | 0.171 | 0.098 | 0.067 |
| 2.201999999999975 | 0.171 | 0.098 | 0.067 |
| 2.204999999999975 | 0.171 | 0.098 | 0.067 |
| 2.207999999999975 | 0.17 | 0.098 | 0.067 |
| 2.210999999999975 | 0.17 | 0.097 | 0.067 |
| 2.213999999999976 | 0.169 | 0.097 | 0.066 |
| 2.216999999999976 | 0.169 | 0.097 | 0.066 |
| 2.219999999999976 | 0.169 | 0.097 | 0.066 |
| 2.222999999999976 | 0.168 | 0.096 | 0.066 |
| 2.225999999999976 | 0.168 | 0.096 | 0.066 |
| 2.228999999999976 | 0.168 | 0.096 | 0.066 |
| 2.231999999999976 | 0.167 | 0.096 | 0.065 |
| 2.234999999999976 | 0.167 | 0.095 | 0.065 |
| 2.237999999999976 | 0.166 | 0.095 | 0.065 |
| 2.240999999999976 | 0.166 | 0.095 | 0.065 |
| 2.243999999999976 | 0.166 | 0.095 | 0.065 |
| 2.246999999999977 | 0.165 | 0.094 | 0.065 |
| 2.249999999999977 | 0.165 | 0.094 | 0.064 |
| 2.252999999999977 | 0.165 | 0.094 | 0.064 |
| 2.255999999999977 | 0.164 | 0.094 | 0.064 |
| 2.258999999999977 | 0.164 | 0.093 | 0.064 |
| 2.261999999999977 | 0.163 | 0.093 | 0.064 |
| 2.264999999999977 | 0.163 | 0.093 | 0.064 |
| 2.267999999999977 | 0.163 | 0.093 | 0.063 |
| 2.270999999999978 | 0.162 | 0.092 | 0.063 |
| 2.273999999999978 | 0.162 | 0.092 | 0.063 |
| 2.276999999999978 | 0.162 | 0.092 | 0.063 |
| 2.279999999999978 | 0.161 | 0.092 | 0.063 |
| 2.282999999999978 | 0.161 | 0.092 | 0.063 |
| 2.285999999999978 | 0.161 | 0.091 | 0.062 |
| 2.288999999999978 | 0.16 | 0.091 | 0.062 |
| 2.291999999999978 | 0.16 | 0.091 | 0.062 |
| 2.294999999999979 | 0.16 | 0.091 | 0.062 |
| 2.297999999999979 | 0.159 | 0.09 | 0.062 |
| 2.300999999999979 | 0.159 | 0.09 | 0.062 |
| 2.303999999999979 | 0.159 | 0.09 | 0.062 |
| 2.306999999999979 | 0.158 | 0.09 | 0.061 |
| 2.309999999999979 | 0.158 | 0.09 | 0.061 |
| 2.312999999999979 | 0.157 | 0.089 | 0.061 |
| 2.315999999999979 | 0.157 | 0.089 | 0.061 |
| 2.318999999999979 | 0.157 | 0.089 | 0.061 |
| 2.32199999999998 | 0.156 | 0.089 | 0.061 |
| 2.32499999999998 | 0.156 | 0.088 | 0.06 |
| 2.32799999999998 | 0.156 | 0.088 | 0.06 |
| 2.33099999999998 | 0.155 | 0.088 | 0.06 |
| 2.33399999999998 | 0.155 | 0.088 | 0.06 |
| 2.33699999999998 | 0.155 | 0.088 | 0.06 |
| 2.33999999999998 | 0.154 | 0.087 | 0.06 |
| 2.34299999999998 | 0.154 | 0.087 | 0.06 |
| 2.34599999999998 | 0.154 | 0.087 | 0.059 |
| 2.348999999999981 | 0.153 | 0.087 | 0.059 |
| 2.351999999999981 | 0.153 | 0.086 | 0.059 |
| 2.354999999999981 | 0.153 | 0.086 | 0.059 |
| 2.357999999999981 | 0.152 | 0.086 | 0.059 |
| 2.360999999999981 | 0.152 | 0.086 | 0.059 |
| 2.363999999999981 | 0.152 | 0.086 | 0.058 |
| 2.366999999999981 | 0.151 | 0.085 | 0.058 |
| 2.369999999999981 | 0.151 | 0.085 | 0.058 |
| 2.372999999999982 | 0.151 | 0.085 | 0.058 |
| 2.375999999999982 | 0.15 | 0.085 | 0.058 |
| 2.378999999999982 | 0.15 | 0.085 | 0.058 |
| 2.381999999999982 | 0.15 | 0.084 | 0.058 |
| 2.384999999999982 | 0.15 | 0.084 | 0.057 |
| 2.387999999999982 | 0.149 | 0.084 | 0.057 |
| 2.390999999999982 | 0.149 | 0.084 | 0.057 |
| 2.393999999999982 | 0.149 | 0.084 | 0.057 |
| 2.396999999999982 | 0.148 | 0.083 | 0.057 |
| 2.399999999999983 | 0.148 | 0.083 | 0.057 |
| 2.402999999999983 | 0.148 | 0.083 | 0.057 |
| 2.405999999999983 | 0.147 | 0.083 | 0.056 |
| 2.408999999999983 | 0.147 | 0.083 | 0.056 |
| 2.411999999999983 | 0.147 | 0.082 | 0.056 |
| 2.414999999999983 | 0.146 | 0.082 | 0.056 |
| 2.417999999999983 | 0.146 | 0.082 | 0.056 |
| 2.420999999999983 | 0.146 | 0.082 | 0.056 |
| 2.423999999999983 | 0.145 | 0.082 | 0.056 |
| 2.426999999999984 | 0.145 | 0.081 | 0.056 |
| 2.429999999999984 | 0.145 | 0.081 | 0.055 |
| 2.432999999999984 | 0.145 | 0.081 | 0.055 |
| 2.435999999999984 | 0.144 | 0.081 | 0.055 |
| 2.438999999999984 | 0.144 | 0.081 | 0.055 |
| 2.441999999999984 | 0.144 | 0.08 | 0.055 |
| 2.444999999999984 | 0.143 | 0.08 | 0.055 |
| 2.447999999999984 | 0.143 | 0.08 | 0.055 |
| 2.450999999999984 | 0.143 | 0.08 | 0.054 |
| 2.453999999999985 | 0.142 | 0.08 | 0.054 |
| 2.456999999999985 | 0.142 | 0.08 | 0.054 |
| 2.459999999999985 | 0.142 | 0.079 | 0.054 |
| 2.462999999999985 | 0.142 | 0.079 | 0.054 |
| 2.465999999999985 | 0.141 | 0.079 | 0.054 |
| 2.468999999999985 | 0.141 | 0.079 | 0.054 |
| 2.471999999999985 | 0.141 | 0.079 | 0.054 |
| 2.474999999999985 | 0.14 | 0.078 | 0.053 |
| 2.477999999999986 | 0.14 | 0.078 | 0.053 |
| 2.480999999999986 | 0.14 | 0.078 | 0.053 |
| 2.483999999999986 | 0.139 | 0.078 | 0.053 |
| 2.486999999999986 | 0.139 | 0.078 | 0.053 |
| 2.489999999999986 | 0.139 | 0.078 | 0.053 |
| 2.492999999999986 | 0.139 | 0.077 | 0.053 |
| 2.495999999999986 | 0.138 | 0.077 | 0.053 |
| 2.498999999999986 | 0.138 | 0.077 | 0.052 |
| 2.501999999999986 | 0.138 | 0.077 | 0.052 |
| 2.504999999999987 | 0.137 | 0.077 | 0.052 |
| 2.507999999999987 | 0.137 | 0.076 | 0.052 |
| 2.510999999999987 | 0.137 | 0.076 | 0.052 |
| 2.513999999999987 | 0.137 | 0.076 | 0.052 |
| 2.516999999999987 | 0.136 | 0.076 | 0.052 |
| 2.519999999999987 | 0.136 | 0.076 | 0.052 |
| 2.522999999999987 | 0.136 | 0.076 | 0.051 |
| 2.525999999999987 | 0.135 | 0.075 | 0.051 |
| 2.528999999999987 | 0.135 | 0.075 | 0.051 |
| 2.531999999999988 | 0.135 | 0.075 | 0.051 |
| 2.534999999999988 | 0.135 | 0.075 | 0.051 |
| 2.537999999999988 | 0.134 | 0.075 | 0.051 |
| 2.540999999999988 | 0.134 | 0.075 | 0.051 |
| 2.543999999999988 | 0.134 | 0.074 | 0.051 |
| 2.546999999999988 | 0.134 | 0.074 | 0.051 |
| 2.549999999999988 | 0.133 | 0.074 | 0.05 |
| 2.552999999999988 | 0.133 | 0.074 | 0.05 |
| 2.555999999999988 | 0.133 | 0.074 | 0.05 |
| 2.558999999999989 | 0.132 | 0.074 | 0.05 |
| 2.561999999999989 | 0.132 | 0.073 | 0.05 |
| 2.564999999999989 | 0.132 | 0.073 | 0.05 |
| 2.567999999999989 | 0.132 | 0.073 | 0.05 |
| 2.570999999999989 | 0.131 | 0.073 | 0.05 |
| 2.573999999999989 | 0.131 | 0.073 | 0.049 |
| 2.576999999999989 | 0.131 | 0.073 | 0.049 |
| 2.579999999999989 | 0.131 | 0.072 | 0.049 |
| 2.58299999999999 | 0.13 | 0.072 | 0.049 |
| 2.58599999999999 | 0.13 | 0.072 | 0.049 |
| 2.58899999999999 | 0.13 | 0.072 | 0.049 |
| 2.59199999999999 | 0.13 | 0.072 | 0.049 |
| 2.59499999999999 | 0.129 | 0.072 | 0.049 |
| 2.59799999999999 | 0.129 | 0.071 | 0.049 |
| 2.60099999999999 | 0.129 | 0.071 | 0.048 |
| 2.60399999999999 | 0.129 | 0.071 | 0.048 |
| 2.60699999999999 | 0.128 | 0.071 | 0.048 |
| 2.60999999999999 | 0.128 | 0.071 | 0.048 |
| 2.612999999999991 | 0.128 | 0.071 | 0.048 |
| 2.615999999999991 | 0.127 | 0.07 | 0.048 |
| 2.618999999999991 | 0.127 | 0.07 | 0.048 |
| 2.621999999999991 | 0.127 | 0.07 | 0.048 |
| 2.624999999999991 | 0.127 | 0.07 | 0.048 |
| 2.627999999999991 | 0.126 | 0.07 | 0.048 |
| 2.630999999999991 | 0.126 | 0.07 | 0.047 |
| 2.633999999999991 | 0.126 | 0.07 | 0.047 |
| 2.636999999999991 | 0.126 | 0.069 | 0.047 |
| 2.639999999999992 | 0.125 | 0.069 | 0.047 |
| 2.642999999999992 | 0.125 | 0.069 | 0.047 |
| 2.645999999999992 | 0.125 | 0.069 | 0.047 |
| 2.648999999999992 | 0.125 | 0.069 | 0.047 |
| 2.651999999999992 | 0.124 | 0.069 | 0.047 |
| 2.654999999999992 | 0.124 | 0.069 | 0.047 |
| 2.657999999999992 | 0.124 | 0.068 | 0.046 |
| 2.660999999999992 | 0.124 | 0.068 | 0.046 |
| 2.663999999999992 | 0.124 | 0.068 | 0.046 |
| 2.666999999999993 | 0.123 | 0.068 | 0.046 |
| 2.669999999999993 | 0.123 | 0.068 | 0.046 |
| 2.672999999999993 | 0.123 | 0.068 | 0.046 |
| 2.675999999999993 | 0.123 | 0.067 | 0.046 |
| 2.678999999999993 | 0.122 | 0.067 | 0.046 |
| 2.681999999999993 | 0.122 | 0.067 | 0.046 |
| 2.684999999999993 | 0.122 | 0.067 | 0.046 |
| 2.687999999999993 | 0.122 | 0.067 | 0.045 |
| 2.690999999999994 | 0.121 | 0.067 | 0.045 |
| 2.693999999999994 | 0.121 | 0.067 | 0.045 |
| 2.696999999999994 | 0.121 | 0.066 | 0.045 |
| 2.699999999999994 | 0.121 | 0.066 | 0.045 |
| 2.702999999999994 | 0.12 | 0.066 | 0.045 |
| 2.705999999999994 | 0.12 | 0.066 | 0.045 |
| 2.708999999999994 | 0.12 | 0.066 | 0.045 |
| 2.711999999999994 | 0.12 | 0.066 | 0.045 |
| 2.714999999999994 | 0.119 | 0.066 | 0.045 |
| 2.717999999999995 | 0.119 | 0.065 | 0.044 |
| 2.720999999999995 | 0.119 | 0.065 | 0.044 |
| 2.723999999999995 | 0.119 | 0.065 | 0.044 |
| 2.726999999999995 | 0.119 | 0.065 | 0.044 |
| 2.729999999999995 | 0.118 | 0.065 | 0.044 |
| 2.732999999999995 | 0.118 | 0.065 | 0.044 |
| 2.735999999999995 | 0.118 | 0.065 | 0.044 |
| 2.738999999999995 | 0.118 | 0.064 | 0.044 |
| 2.741999999999995 | 0.117 | 0.064 | 0.044 |
| 2.744999999999996 | 0.117 | 0.064 | 0.044 |
| 2.747999999999996 | 0.117 | 0.064 | 0.044 |
| 2.750999999999996 | 0.117 | 0.064 | 0.043 |
| 2.753999999999996 | 0.116 | 0.064 | 0.043 |
| 2.756999999999996 | 0.116 | 0.064 | 0.043 |
| 2.759999999999996 | 0.116 | 0.064 | 0.043 |
| 2.762999999999996 | 0.116 | 0.063 | 0.043 |
| 2.765999999999996 | 0.116 | 0.063 | 0.043 |
| 2.768999999999996 | 0.115 | 0.063 | 0.043 |
| 2.771999999999997 | 0.115 | 0.063 | 0.043 |
| 2.774999999999997 | 0.115 | 0.063 | 0.043 |
| 2.777999999999997 | 0.115 | 0.063 | 0.043 |
| 2.780999999999997 | 0.114 | 0.063 | 0.042 |
| 2.783999999999997 | 0.114 | 0.062 | 0.042 |
| 2.786999999999997 | 0.114 | 0.062 | 0.042 |
| 2.789999999999997 | 0.114 | 0.062 | 0.042 |
| 2.792999999999997 | 0.114 | 0.062 | 0.042 |
| 2.795999999999998 | 0.113 | 0.062 | 0.042 |
| 2.798999999999998 | 0.113 | 0.062 | 0.042 |
| 2.801999999999998 | 0.113 | 0.062 | 0.042 |
| 2.804999999999998 | 0.113 | 0.062 | 0.042 |
| 2.807999999999998 | 0.113 | 0.061 | 0.042 |
| 2.810999999999998 | 0.112 | 0.061 | 0.042 |
| 2.813999999999998 | 0.112 | 0.061 | 0.042 |
| 2.816999999999998 | 0.112 | 0.061 | 0.041 |
| 2.819999999999998 | 0.112 | 0.061 | 0.041 |
| 2.822999999999999 | 0.111 | 0.061 | 0.041 |
| 2.825999999999999 | 0.111 | 0.061 | 0.041 |
| 2.828999999999999 | 0.111 | 0.061 | 0.041 |
| 2.831999999999999 | 0.111 | 0.06 | 0.041 |
| 2.834999999999999 | 0.111 | 0.06 | 0.041 |
| 2.837999999999999 | 0.11 | 0.06 | 0.041 |
| 2.840999999999999 | 0.11 | 0.06 | 0.041 |
| 2.843999999999999 | 0.11 | 0.06 | 0.041 |
| 2.846999999999999 | 0.11 | 0.06 | 0.041 |
| 2.85 | 0.11 | 0.06 | 0.04 |
| 2.853 | 0.109 | 0.06 | 0.04 |
| 2.856 | 0.109 | 0.059 | 0.04 |
| 2.859 | 0.109 | 0.059 | 0.04 |
| 2.862 | 0.109 | 0.059 | 0.04 |
| 2.865 | 0.109 | 0.059 | 0.04 |
| 2.868 | 0.108 | 0.059 | 0.04 |
| 2.871 | 0.108 | 0.059 | 0.04 |
| 2.874000000000001 | 0.108 | 0.059 | 0.04 |
| 2.877000000000001 | 0.108 | 0.059 | 0.04 |
| 2.880000000000001 | 0.108 | 0.059 | 0.04 |
| 2.883000000000001 | 0.107 | 0.058 | 0.04 |
| 2.886000000000001 | 0.107 | 0.058 | 0.039 |
| 2.889000000000001 | 0.107 | 0.058 | 0.039 |
| 2.892000000000001 | 0.107 | 0.058 | 0.039 |
| 2.895000000000001 | 0.107 | 0.058 | 0.039 |
| 2.898000000000001 | 0.106 | 0.058 | 0.039 |
| 2.901000000000002 | 0.106 | 0.058 | 0.039 |
| 2.904000000000002 | 0.106 | 0.058 | 0.039 |
| 2.907000000000002 | 0.106 | 0.057 | 0.039 |
| 2.910000000000002 | 0.106 | 0.057 | 0.039 |
| 2.913000000000002 | 0.105 | 0.057 | 0.039 |
| 2.916000000000002 | 0.105 | 0.057 | 0.039 |
| 2.919000000000002 | 0.105 | 0.057 | 0.039 |
| 2.922000000000002 | 0.105 | 0.057 | 0.039 |
| 2.925000000000002 | 0.105 | 0.057 | 0.038 |
| 2.928000000000003 | 0.104 | 0.057 | 0.038 |
| 2.931000000000003 | 0.104 | 0.057 | 0.038 |
| 2.934000000000003 | 0.104 | 0.056 | 0.038 |
| 2.937000000000003 | 0.104 | 0.056 | 0.038 |
| 2.940000000000003 | 0.104 | 0.056 | 0.038 |
| 2.943000000000003 | 0.104 | 0.056 | 0.038 |
| 2.946000000000003 | 0.103 | 0.056 | 0.038 |
| 2.949000000000003 | 0.103 | 0.056 | 0.038 |
| 2.952000000000003 | 0.103 | 0.056 | 0.038 |
| 2.955000000000004 | 0.103 | 0.056 | 0.038 |
| 2.958000000000004 | 0.103 | 0.056 | 0.038 |
| 2.961000000000004 | 0.102 | 0.055 | 0.038 |
| 2.964000000000004 | 0.102 | 0.055 | 0.037 |
| 2.967000000000004 | 0.102 | 0.055 | 0.037 |
| 2.970000000000004 | 0.102 | 0.055 | 0.037 |
| 2.973000000000004 | 0.102 | 0.055 | 0.037 |
| 2.976000000000004 | 0.101 | 0.055 | 0.037 |
| 2.979000000000005 | 0.101 | 0.055 | 0.037 |
| 2.982000000000005 | 0.101 | 0.055 | 0.037 |
| 2.985000000000005 | 0.101 | 0.055 | 0.037 |
| 2.988000000000005 | 0.101 | 0.054 | 0.037 |
| 2.991000000000005 | 0.101 | 0.054 | 0.037 |
| 2.994000000000005 | 0.1 | 0.054 | 0.037 |
| 2.997000000000005 | 0.1 | 0.054 | 0.037 |
| 3.000000000000005 | 0.1 | 0.054 | 0.037 |